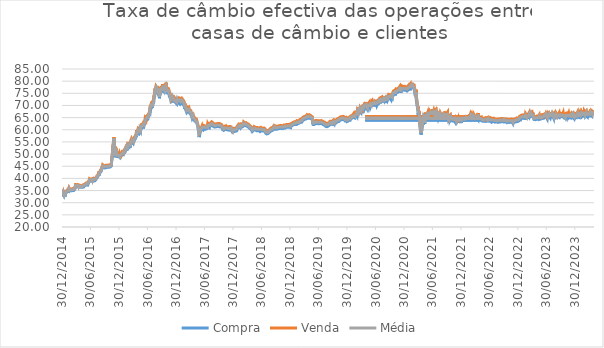
| Category | Compra | Venda | Média |
|---|---|---|---|
| 30/12/2014 | 32.49 | 33.15 | 32.82 |
| 31/12/2014 | 32.87 | 33.65 | 33.26 |
| 05/01/2015 | 33.7 | 34.37 | 34.04 |
| 06/01/2015 | 33.32 | 34.04 | 33.68 |
| 07/01/2015 | 32.98 | 33.72 | 33.35 |
| 08/01/2015 | 33.37 | 34.12 | 33.75 |
| 09/01/2015 | 33.6 | 34.32 | 33.96 |
| 12/01/2015 | 33.06 | 33.74 | 33.4 |
| 13/01/2015 | 33.2 | 33.86 | 33.53 |
| 14/01/2015 | 33.52 | 34.12 | 33.82 |
| 16/01/2015 | 33.72 | 34.39 | 34.06 |
| 19/01/2015 | 33.55 | 34.36 | 33.96 |
| 20/01/2015 | 33.47 | 34.18 | 33.83 |
| 21/01/2015 | 33.24 | 33.99 | 33.62 |
| 22/01/2015 | 33.83 | 34.48 | 34.16 |
| 23/01/2015 | 33.92 | 34.58 | 34.25 |
| 26/01/2015 | 33.51 | 34.37 | 33.94 |
| 27/01/2015 | 34.03 | 34.68 | 34.36 |
| 28/01/2015 | 33.82 | 34.59 | 34.21 |
| 29/01/2015 | 34.3 | 35.06 | 34.68 |
| 30/01/2015 | 34.33 | 34.99 | 34.66 |
| 02/02/2015 | 34.4 | 35.17 | 34.79 |
| 04/02/2015 | 34.48 | 35.26 | 34.87 |
| 05/02/2015 | 34.62 | 35.43 | 35.03 |
| 06/02/2015 | 34.03 | 34.74 | 34.39 |
| 09/02/2015 | 34.87 | 35.56 | 35.22 |
| 10/02/2015 | 35.17 | 35.89 | 35.53 |
| 11/02/2015 | 35.05 | 35.87 | 35.46 |
| 12/02/2015 | 35.44 | 36.15 | 35.8 |
| 13/02/2015 | 35.18 | 35.85 | 35.52 |
| 16/02/2015 | 34.82 | 35.58 | 35.2 |
| 17/02/2015 | 34.72 | 35.47 | 35.1 |
| 18/02/2015 | 34.9 | 35.59 | 35.25 |
| 19/02/2015 | 34.98 | 35.76 | 35.37 |
| 20/02/2015 | 35.07 | 35.65 | 35.36 |
| 23/02/2015 | 34.9 | 35.53 | 35.22 |
| 24/02/2015 | 35.01 | 35.58 | 35.3 |
| 25/02/2015 | 34.67 | 35.52 | 35.1 |
| 26/02/2015 | 34.53 | 35.23 | 34.88 |
| 27/02/2015 | 35.12 | 35.68 | 35.4 |
| 02/03/2015 | 34.93 | 35.69 | 35.31 |
| 03/03/2015 | 35.16 | 35.85 | 35.51 |
| 04/03/2015 | 34.98 | 35.68 | 35.33 |
| 05/03/2015 | 34.97 | 35.72 | 35.35 |
| 06/03/2015 | 35.12 | 35.82 | 35.47 |
| 09/03/2015 | 34.98 | 35.8 | 35.39 |
| 10/03/2015 | 35.18 | 35.87 | 35.53 |
| 11/03/2015 | 35.21 | 35.9 | 35.56 |
| 12/03/2015 | 34.99 | 35.7 | 35.35 |
| 13/03/2015 | 35.16 | 35.85 | 35.51 |
| 16/03/2015 | 35.05 | 35.88 | 35.47 |
| 17/03/2015 | 34.9 | 35.67 | 35.29 |
| 18/03/2015 | 34.93 | 35.66 | 35.3 |
| 19/03/2015 | 35.18 | 35.8 | 35.49 |
| 20/03/2015 | 35.33 | 36.04 | 35.69 |
| 23/03/2015 | 35.71 | 36.37 | 36.04 |
| 24/03/2015 | 35.78 | 36.6 | 36.19 |
| 25/03/2015 | 36.32 | 36.99 | 36.66 |
| 26/03/2015 | 36.73 | 37.45 | 37.09 |
| 27/03/2015 | 36.85 | 37.63 | 37.24 |
| 30/03/2015 | 36.85 | 37.6 | 37.23 |
| 31/03/2015 | 36.95 | 37.71 | 37.33 |
| 01/04/2015 | 36.61 | 37.27 | 36.94 |
| 02/04/2015 | 36.64 | 37.43 | 37.04 |
| 03/04/2015 | 36.83 | 37.56 | 37.2 |
| 06/04/2015 | 36.81 | 37.6 | 37.21 |
| 08/04/2015 | 36.59 | 37.45 | 37.02 |
| 09/04/2015 | 36.64 | 37.36 | 37 |
| 10/04/2015 | 36.59 | 37.31 | 36.95 |
| 13/04/2015 | 36.21 | 36.86 | 36.54 |
| 14/04/2015 | 36.45 | 37.22 | 36.84 |
| 15/04/2015 | 36.69 | 37.35 | 37.02 |
| 16/04/2015 | 36.52 | 37.21 | 36.87 |
| 17/04/2015 | 36.46 | 37.21 | 36.84 |
| 20/04/2015 | 36.66 | 37.34 | 37 |
| 21/04/2015 | 36.36 | 37.09 | 36.73 |
| 22/04/2015 | 36.44 | 37.18 | 36.81 |
| 23/04/2015 | 36.22 | 37.05 | 36.64 |
| 24/04/2015 | 36.33 | 37.08 | 36.71 |
| 27/04/2015 | 36.31 | 37.06 | 36.69 |
| 28/04/2015 | 36.16 | 36.98 | 36.57 |
| 29/04/2015 | 36.17 | 36.93 | 36.55 |
| 30/04/2015 | 36.35 | 37.09 | 36.72 |
| 04/05/2015 | 36.39 | 37.14 | 36.77 |
| 05/05/2015 | 36.25 | 36.98 | 36.62 |
| 06/05/2015 | 36.19 | 36.95 | 36.57 |
| 07/05/2015 | 36.21 | 36.99 | 36.6 |
| 08/05/2015 | 36.33 | 37.08 | 36.71 |
| 11/05/2015 | 36.32 | 37.14 | 36.73 |
| 12/05/2015 | 36.31 | 37.17 | 36.74 |
| 13/05/2015 | 36.49 | 37.29 | 36.89 |
| 14/05/2015 | 36.42 | 37.2 | 36.81 |
| 15/05/2015 | 36.61 | 37.29 | 36.95 |
| 18/05/2015 | 36.49 | 37.46 | 36.98 |
| 19/05/2015 | 36.73 | 37.49 | 37.11 |
| 20/05/2015 | 36.79 | 37.54 | 37.17 |
| 21/05/2015 | 36.85 | 37.5 | 37.18 |
| 22/05/2015 | 37.08 | 37.82 | 37.45 |
| 25/05/2015 | 36.88 | 37.66 | 37.27 |
| 26/05/2015 | 37.01 | 37.75 | 37.38 |
| 27/05/2015 | 36.97 | 37.67 | 37.32 |
| 28/05/2015 | 36.95 | 37.69 | 37.32 |
| 29/05/2015 | 37.08 | 37.86 | 37.47 |
| 01/06/2015 | 37.09 | 37.84 | 37.47 |
| 02/06/2015 | 37.38 | 38.12 | 37.75 |
| 03/06/2015 | 37.23 | 37.92 | 37.58 |
| 04/06/2015 | 37.13 | 37.95 | 37.54 |
| 05/06/2015 | 37.29 | 37.98 | 37.64 |
| 08/06/2015 | 37.3 | 38.11 | 37.71 |
| 09/06/2015 | 37.31 | 38.09 | 37.7 |
| 10/06/2015 | 37.41 | 38.2 | 37.81 |
| 11/06/2015 | 37.49 | 38.22 | 37.86 |
| 12/06/2015 | 37.24 | 38.02 | 37.63 |
| 15/06/2015 | 37.78 | 38.56 | 38.17 |
| 16/06/2015 | 37.94 | 38.68 | 38.31 |
| 17/06/2015 | 38.08 | 38.76 | 38.42 |
| 18/06/2015 | 38.09 | 38.82 | 38.46 |
| 19/06/2015 | 38.12 | 38.93 | 38.53 |
| 22/06/2015 | 38.53 | 39.3 | 38.92 |
| 23/06/2015 | 38.53 | 39.32 | 38.93 |
| 24/06/2015 | 38.97 | 39.88 | 39.43 |
| 26/06/2015 | 39.15 | 39.91 | 39.53 |
| 29/06/2015 | 38.9 | 39.79 | 39.35 |
| 30/06/2015 | 39.09 | 39.84 | 39.47 |
| 01/07/2015 | 38.95 | 39.62 | 39.29 |
| 02/07/2015 | 38.97 | 39.8 | 39.39 |
| 03/07/2015 | 39.11 | 39.98 | 39.55 |
| 06/07/2015 | 39.01 | 39.85 | 39.43 |
| 07/07/2015 | 39.01 | 39.72 | 39.37 |
| 08/07/2015 | 38.85 | 39.77 | 39.31 |
| 09/07/2015 | 39.01 | 39.85 | 39.43 |
| 10/07/2015 | 39.21 | 40 | 39.61 |
| 13/07/2015 | 39.11 | 39.89 | 39.5 |
| 14/07/2015 | 39.08 | 39.89 | 39.49 |
| 15/07/2015 | 39.15 | 39.98 | 39.57 |
| 16/07/2015 | 38.75 | 39.52 | 39.14 |
| 17/07/2015 | 39.1 | 39.88 | 39.49 |
| 20/07/2015 | 39.25 | 39.99 | 39.62 |
| 21/07/2015 | 39.25 | 40.03 | 39.64 |
| 22/07/2015 | 38.89 | 39.69 | 39.29 |
| 23/07/2015 | 38.84 | 39.68 | 39.26 |
| 24/07/2015 | 39.25 | 40.01 | 39.63 |
| 27/07/2015 | 39.1 | 39.97 | 39.54 |
| 28/07/2015 | 39.18 | 39.97 | 39.58 |
| 29/07/2015 | 39.07 | 39.86 | 39.47 |
| 30/07/2015 | 39.17 | 40.02 | 39.6 |
| 31/07/2015 | 39.34 | 40.09 | 39.72 |
| 03/08/2015 | 39.44 | 40.14 | 39.79 |
| 04/08/2015 | 39.51 | 40.33 | 39.92 |
| 05/08/2015 | 39.8 | 40.51 | 40.16 |
| 06/08/2015 | 39.71 | 40.58 | 40.15 |
| 07/08/2015 | 39.95 | 40.8 | 40.38 |
| 10/08/2015 | 40.17 | 40.95 | 40.56 |
| 11/08/2015 | 40.24 | 41.06 | 40.65 |
| 12/08/2015 | 40.26 | 41.04 | 40.65 |
| 13/08/2015 | 40.33 | 41.2 | 40.77 |
| 14/08/2015 | 40.43 | 41.24 | 40.84 |
| 17/08/2015 | 40.56 | 41.43 | 41 |
| 18/08/2015 | 40.55 | 41.44 | 41 |
| 19/08/2015 | 40.83 | 41.69 | 41.26 |
| 20/08/2015 | 41.42 | 42.37 | 41.9 |
| 21/08/2015 | 41.38 | 42.09 | 41.74 |
| 24/08/2015 | 41.4 | 42.29 | 41.85 |
| 25/08/2015 | 41.46 | 42.31 | 41.89 |
| 26/08/2015 | 41.46 | 42.17 | 41.82 |
| 27/08/2015 | 41.58 | 42.49 | 42.04 |
| 28/08/2015 | 42.03 | 42.9 | 42.47 |
| 31/08/2015 | 41.8 | 42.96 | 42.38 |
| 01/09/2015 | 42.46 | 43.29 | 42.88 |
| 02/09/2015 | 42.54 | 43.45 | 43 |
| 03/09/2015 | 42.61 | 43.35 | 42.98 |
| 04/09/2015 | 42.67 | 43.23 | 42.95 |
| 08/09/2015 | 43.08 | 43.86 | 43.47 |
| 09/09/2015 | 42.97 | 43.84 | 43.41 |
| 10/09/2015 | 43.33 | 44.06 | 43.7 |
| 11/09/2015 | 43.99 | 44.67 | 44.33 |
| 14/09/2015 | 44.21 | 45.17 | 44.69 |
| 15/09/2015 | 44.22 | 45.25 | 44.74 |
| 16/09/2015 | 44.69 | 45.62 | 45.16 |
| 17/09/2015 | 44.55 | 45.21 | 44.88 |
| 18/09/2015 | 44.55 | 45.42 | 44.99 |
| 21/09/2015 | 44.51 | 45.52 | 45.02 |
| 22/09/2015 | 44.35 | 45.37 | 44.86 |
| 23/09/2015 | 44.37 | 45.21 | 44.79 |
| 24/09/2015 | 44.53 | 45.41 | 44.97 |
| 28/09/2015 | 44.35 | 45.25 | 44.8 |
| 29/09/2015 | 44.41 | 45.17 | 44.79 |
| 30/09/2015 | 44.26 | 45.16 | 44.71 |
| 01/10/2015 | 44.44 | 45.4 | 44.92 |
| 02/10/2015 | 44.57 | 45.56 | 45.07 |
| 06/10/2015 | 44.32 | 45.21 | 44.77 |
| 07/10/2015 | 44.49 | 45.44 | 44.97 |
| 08/10/2015 | 44.41 | 45.44 | 44.93 |
| 09/10/2015 | 44.28 | 45.24 | 44.76 |
| 12/10/2015 | 44.25 | 45.21 | 44.73 |
| 13/10/2015 | 44.35 | 45.31 | 44.83 |
| 14/10/2015 | 44.5 | 45.37 | 44.94 |
| 15/10/2015 | 44.7 | 45.62 | 45.16 |
| 16/10/2015 | 44.49 | 45.36 | 44.93 |
| 19/10/2015 | 44.42 | 45.3 | 44.86 |
| 20/10/2015 | 44.59 | 45.46 | 45.03 |
| 21/10/2015 | 44.58 | 45.47 | 45.03 |
| 22/10/2015 | 44.57 | 45.42 | 45 |
| 23/10/2015 | 44.54 | 45.4 | 44.97 |
| 26/10/2015 | 44.63 | 45.56 | 45.1 |
| 27/10/2015 | 44.6 | 45.59 | 45.1 |
| 28/10/2015 | 44.58 | 45.41 | 45 |
| 29/10/2015 | 44.71 | 45.63 | 45.17 |
| 30/10/2015 | 44.64 | 45.59 | 45.12 |
| 02/11/2015 | 44.81 | 45.7 | 45.26 |
| 03/11/2015 | 44.7 | 45.57 | 45.14 |
| 04/11/2015 | 44.73 | 45.73 | 45.23 |
| 05/11/2015 | 44.78 | 45.67 | 45.23 |
| 06/11/2015 | 44.79 | 45.72 | 45.26 |
| 09/11/2015 | 44.89 | 45.72 | 45.31 |
| 11/11/2015 | 45.1 | 45.98 | 45.54 |
| 12/11/2015 | 45.91 | 46.84 | 46.38 |
| 13/11/2015 | 47.31 | 48.17 | 47.74 |
| 16/11/2015 | 48.52 | 49.43 | 48.98 |
| 17/11/2015 | 49.18 | 49.62 | 49.4 |
| 18/11/2015 | 50.23 | 50.95 | 50.59 |
| 19/11/2015 | 50.13 | 50.93 | 50.53 |
| 20/11/2015 | 52.17 | 53.19 | 52.68 |
| 23/11/2015 | 51.61 | 53.09 | 52.35 |
| 24/11/2015 | 54.06 | 54.81 | 54.44 |
| 25/11/2015 | 54.84 | 56.17 | 55.51 |
| 26/11/2015 | 55.63 | 56.56 | 56.1 |
| 27/11/2015 | 56.11 | 56.99 | 56.55 |
| 30/11/2015 | 53.83 | 55.09 | 54.46 |
| 01/12/2015 | 51.81 | 53 | 52.41 |
| 02/12/2015 | 48.72 | 49.95 | 49.34 |
| 03/12/2015 | 50.32 | 51.6 | 50.96 |
| 04/12/2015 | 51.95 | 53.03 | 52.49 |
| 07/12/2015 | 51.14 | 52.24 | 51.69 |
| 08/12/2015 | 51.72 | 52.97 | 52.35 |
| 09/12/2015 | 50.79 | 51.8 | 51.3 |
| 10/12/2015 | 51.15 | 52.25 | 51.7 |
| 11/12/2015 | 51.08 | 52.39 | 51.74 |
| 14/12/2015 | 50.25 | 51.17 | 50.71 |
| 15/12/2015 | 49.77 | 50.77 | 50.27 |
| 16/12/2015 | 49.82 | 50.88 | 50.35 |
| 17/12/2015 | 49.45 | 50.38 | 49.92 |
| 18/12/2015 | 48.99 | 49.93 | 49.46 |
| 21/12/2015 | 49.04 | 50.04 | 49.54 |
| 22/12/2015 | 49.05 | 50.14 | 49.6 |
| 23/12/2015 | 48.97 | 49.97 | 49.47 |
| 24/12/2015 | 48.94 | 50.21 | 49.58 |
| 28/12/2015 | 49.01 | 49.96 | 49.49 |
| 29/12/2015 | 49.09 | 50.04 | 49.57 |
| 30/12/2015 | 48.98 | 50.16 | 49.57 |
| 31/12/2015 | 48.97 | 50.47 | 49.72 |
| 04/01/2016 | 48.65 | 49.4 | 49.03 |
| 05/01/2016 | 49.3 | 50.37 | 49.84 |
| 06/01/2016 | 48.87 | 49.9 | 49.39 |
| 07/01/2016 | 49 | 50.1 | 49.55 |
| 08/01/2016 | 48.77 | 49.9 | 49.34 |
| 11/01/2016 | 48.96 | 50.11 | 49.54 |
| 12/01/2016 | 48.94 | 50.12 | 49.53 |
| 13/01/2016 | 49.24 | 50.5 | 49.87 |
| 14/01/2016 | 49.22 | 50.12 | 49.67 |
| 15/01/2016 | 49.05 | 50.02 | 49.54 |
| 18/01/2016 | 49.37 | 50.29 | 49.83 |
| 19/01/2016 | 49.84 | 50.86 | 50.35 |
| 20/01/2016 | 49.63 | 50.82 | 50.23 |
| 21/01/2016 | 49.44 | 50.51 | 49.98 |
| 22/01/2016 | 49.9 | 50.82 | 50.36 |
| 25/01/2016 | 49.78 | 50.86 | 50.32 |
| 26/01/2016 | 49.75 | 50.64 | 50.2 |
| 27/01/2016 | 50.18 | 51.27 | 50.73 |
| 28/01/2016 | 50.29 | 51.48 | 50.89 |
| 29/01/2016 | 50.6 | 51.55 | 51.08 |
| 01/02/2016 | 50.57 | 51.36 | 50.97 |
| 02/02/2016 | 50.5 | 51.41 | 50.96 |
| 04/02/2016 | 50.88 | 51.93 | 51.41 |
| 05/02/2016 | 50.72 | 51.57 | 51.15 |
| 08/02/2016 | 51.2 | 52.25 | 51.73 |
| 09/02/2016 | 51.82 | 52.6 | 52.21 |
| 10/02/2016 | 51.38 | 52.43 | 51.91 |
| 11/02/2016 | 51.17 | 52.16 | 51.67 |
| 12/02/2016 | 51.57 | 52.53 | 52.05 |
| 15/02/2016 | 51.55 | 52.57 | 52.06 |
| 16/02/2016 | 51.71 | 52.73 | 52.22 |
| 17/02/2016 | 52.16 | 53.12 | 52.64 |
| 18/02/2016 | 51.27 | 52.28 | 51.78 |
| 19/02/2016 | 52.51 | 53.45 | 52.98 |
| 22/02/2016 | 51.68 | 52.84 | 52.26 |
| 23/02/2016 | 53.44 | 54.5 | 53.97 |
| 24/02/2016 | 52.98 | 53.92 | 53.45 |
| 25/02/2016 | 53.47 | 54.42 | 53.95 |
| 26/02/2016 | 53.33 | 54.23 | 53.78 |
| 29/02/2016 | 53.06 | 54.18 | 53.62 |
| 01/03/2016 | 53.42 | 54.66 | 54.04 |
| 02/03/2016 | 53.45 | 54.55 | 54 |
| 03/03/2016 | 53.05 | 54.31 | 53.68 |
| 04/03/2016 | 53.86 | 54.99 | 54.43 |
| 07/03/2016 | 54.13 | 55.2 | 54.67 |
| 08/03/2016 | 53.99 | 55.04 | 54.52 |
| 09/03/2016 | 53.99 | 55.04 | 54.52 |
| 10/03/2016 | 52.66 | 53.79 | 53.23 |
| 11/03/2016 | 53.76 | 54.94 | 54.35 |
| 14/03/2016 | 53.9 | 54.95 | 54.43 |
| 15/03/2016 | 53.72 | 54.9 | 54.31 |
| 16/03/2016 | 54.96 | 55.79 | 55.38 |
| 17/03/2016 | 54.81 | 55.76 | 55.29 |
| 18/03/2016 | 54.08 | 55.11 | 54.6 |
| 21/03/2016 | 54.41 | 55.35 | 54.88 |
| 22/03/2016 | 54.73 | 56.04 | 55.39 |
| 23/03/2016 | 54.12 | 55.38 | 54.75 |
| 24/03/2016 | 55.08 | 56.14 | 55.61 |
| 28/03/2016 | 55.31 | 56.4 | 55.86 |
| 29/03/2016 | 54.61 | 55.78 | 55.2 |
| 30/03/2016 | 54.61 | 55.69 | 55.15 |
| 31/03/2016 | 55.43 | 56.42 | 55.93 |
| 01/04/2016 | 54.72 | 55.78 | 55.25 |
| 04/04/2016 | 54.99 | 56.25 | 55.62 |
| 05/04/2016 | 55.73 | 56.83 | 56.28 |
| 06/04/2016 | 56.01 | 57.07 | 56.54 |
| 08/04/2016 | 55.79 | 56.78 | 56.29 |
| 11/04/2016 | 56.14 | 57.33 | 56.74 |
| 12/04/2016 | 56.16 | 57.43 | 56.8 |
| 13/04/2016 | 56.27 | 57.14 | 56.71 |
| 14/04/2016 | 56.7 | 57.78 | 57.24 |
| 15/04/2016 | 56.59 | 57.63 | 57.11 |
| 18/04/2016 | 57.47 | 58.43 | 57.95 |
| 19/04/2016 | 57.06 | 58.03 | 57.55 |
| 20/04/2016 | 56.9 | 58.08 | 57.49 |
| 21/04/2016 | 58.69 | 59.83 | 59.26 |
| 22/04/2016 | 57.86 | 58.85 | 58.36 |
| 25/04/2016 | 58.28 | 59.4 | 58.84 |
| 26/04/2016 | 58.53 | 59.39 | 58.96 |
| 27/04/2016 | 58.15 | 59.15 | 58.65 |
| 28/04/2016 | 58.6 | 59.62 | 59.11 |
| 29/04/2016 | 58.92 | 60.2 | 59.56 |
| 03/05/2016 | 58.53 | 59.69 | 59.11 |
| 04/05/2016 | 58.52 | 59.72 | 59.12 |
| 05/05/2016 | 58.86 | 59.85 | 59.36 |
| 06/05/2016 | 58.42 | 59.51 | 58.97 |
| 09/05/2016 | 58.52 | 59.68 | 59.1 |
| 10/05/2016 | 58.66 | 59.8 | 59.23 |
| 11/05/2016 | 59.22 | 60.31 | 59.77 |
| 12/05/2016 | 59.78 | 61.11 | 60.45 |
| 13/05/2016 | 59.66 | 60.84 | 60.25 |
| 16/05/2016 | 59.33 | 60.52 | 59.93 |
| 17/05/2016 | 60.15 | 61.3 | 60.73 |
| 18/05/2016 | 59.75 | 60.95 | 60.35 |
| 19/05/2016 | 60.24 | 61.72 | 60.98 |
| 20/05/2016 | 60.38 | 61.52 | 60.95 |
| 23/05/2016 | 61.4 | 62.54 | 61.97 |
| 24/05/2016 | 61.08 | 61.96 | 61.52 |
| 25/05/2016 | 60.82 | 61.9 | 61.36 |
| 26/05/2016 | 60.94 | 62.36 | 61.65 |
| 27/05/2016 | 60.93 | 62.05 | 61.49 |
| 30/05/2016 | 61.08 | 62.04 | 61.56 |
| 31/05/2016 | 61.41 | 62.65 | 62.03 |
| 01/06/2016 | 61.25 | 62.6 | 61.93 |
| 02/06/2016 | 61.41 | 62.64 | 62.03 |
| 03/06/2016 | 60.55 | 61.69 | 61.12 |
| 06/06/2016 | 61.35 | 62.65 | 62 |
| 07/06/2016 | 61.65 | 62.94 | 62.3 |
| 08/06/2016 | 61.82 | 62.89 | 62.36 |
| 09/06/2016 | 62.1 | 63.16 | 62.63 |
| 10/06/2016 | 62.03 | 62.94 | 62.49 |
| 13/06/2016 | 62.47 | 63.95 | 63.21 |
| 14/06/2016 | 62.23 | 63.52 | 62.88 |
| 15/06/2016 | 63.25 | 64.5 | 63.88 |
| 16/06/2016 | 63.7 | 64.71 | 64.21 |
| 17/06/2016 | 63.23 | 64.45 | 63.84 |
| 20/06/2016 | 63 | 63.96 | 63.48 |
| 21/06/2016 | 63.5 | 64.69 | 64.1 |
| 22/06/2016 | 64.1 | 65.47 | 64.79 |
| 23/06/2016 | 64.03 | 65.22 | 64.63 |
| 24/06/2016 | 64.4 | 65.58 | 64.99 |
| 27/06/2016 | 64.04 | 65.27 | 64.66 |
| 28/06/2016 | 64.12 | 65.34 | 64.73 |
| 29/06/2016 | 64.65 | 65.83 | 65.24 |
| 30/06/2016 | 63.91 | 65.17 | 64.54 |
| 01/07/2016 | 64.63 | 65.85 | 65.24 |
| 04/07/2016 | 64.69 | 65.85 | 65.27 |
| 05/07/2016 | 65.14 | 66.29 | 65.72 |
| 06/07/2016 | 64.91 | 66.16 | 65.54 |
| 07/07/2016 | 65.18 | 66.49 | 65.84 |
| 08/07/2016 | 65.38 | 66.63 | 66.01 |
| 11/07/2016 | 65.91 | 67.14 | 66.53 |
| 12/07/2016 | 66.37 | 67.49 | 66.93 |
| 13/07/2016 | 67.02 | 67.74 | 67.38 |
| 14/07/2016 | 67.39 | 68.26 | 67.83 |
| 15/07/2016 | 68.15 | 69.37 | 68.76 |
| 18/07/2016 | 67.69 | 69.02 | 68.36 |
| 19/07/2016 | 68.03 | 69.19 | 68.61 |
| 20/07/2016 | 68.56 | 69.71 | 69.14 |
| 21/07/2016 | 68.95 | 70.23 | 69.59 |
| 22/07/2016 | 68.91 | 70.17 | 69.54 |
| 25/07/2016 | 69.02 | 70.42 | 69.72 |
| 26/07/2016 | 68.83 | 70.14 | 69.49 |
| 27/07/2016 | 69.97 | 71.35 | 70.66 |
| 28/07/2016 | 69.02 | 70.26 | 69.64 |
| 29/07/2016 | 70.18 | 71.56 | 70.87 |
| 01/08/2016 | 69.4 | 70.71 | 70.06 |
| 02/08/2016 | 70.35 | 71.64 | 71 |
| 03/08/2016 | 70.38 | 71.77 | 71.08 |
| 04/08/2016 | 70.46 | 71.86 | 71.16 |
| 05/08/2016 | 70.82 | 71.88 | 71.35 |
| 08/08/2016 | 71.24 | 71.84 | 71.54 |
| 09/08/2016 | 71.44 | 72.87 | 72.16 |
| 10/08/2016 | 72.76 | 74.05 | 73.41 |
| 11/08/2016 | 73.18 | 73.56 | 73.37 |
| 12/08/2016 | 72.99 | 74.37 | 73.68 |
| 15/08/2016 | 73.84 | 75.42 | 74.63 |
| 16/08/2016 | 74.62 | 75.84 | 75.23 |
| 17/08/2016 | 75.86 | 76.97 | 76.42 |
| 18/08/2016 | 75.16 | 76.15 | 75.66 |
| 19/08/2016 | 75.54 | 76.82 | 76.18 |
| 22/08/2016 | 76.29 | 77.73 | 77.01 |
| 23/08/2016 | 76.61 | 78.08 | 77.35 |
| 24/08/2016 | 76.14 | 77.47 | 76.81 |
| 25/08/2016 | 75.9 | 77.55 | 76.73 |
| 26/08/2016 | 75.84 | 77.2 | 76.52 |
| 29/08/2016 | 76.46 | 78 | 77.23 |
| 30/08/2016 | 75.47 | 77.48 | 76.48 |
| 31/08/2016 | 76.19 | 77.72 | 76.96 |
| 01/09/2016 | 76.06 | 77.46 | 76.76 |
| 02/09/2016 | 75.91 | 77.23 | 76.57 |
| 05/09/2016 | 75.48 | 77.06 | 76.27 |
| 06/09/2016 | 76.1 | 77.69 | 76.9 |
| 08/09/2016 | 74.48 | 75.8 | 75.14 |
| 09/09/2016 | 74.12 | 75.45 | 74.79 |
| 12/09/2016 | 74 | 75.4 | 74.7 |
| 13/09/2016 | 74.07 | 75.81 | 74.94 |
| 14/09/2016 | 72.96 | 74.15 | 73.56 |
| 15/09/2016 | 73.4 | 74.98 | 74.19 |
| 16/09/2016 | 74.09 | 75.27 | 74.68 |
| 19/09/2016 | 74.15 | 75.78 | 74.97 |
| 20/09/2016 | 74.53 | 75.87 | 75.2 |
| 21/09/2016 | 74.52 | 75.69 | 75.11 |
| 22/09/2016 | 75.42 | 76.89 | 76.16 |
| 23/09/2016 | 75.44 | 76.78 | 76.11 |
| 27/09/2016 | 76.61 | 78.03 | 77.32 |
| 28/09/2016 | 75.44 | 77.05 | 76.25 |
| 29/09/2016 | 76.42 | 77.64 | 77.03 |
| 30/09/2016 | 75.93 | 77.39 | 76.66 |
| 03/10/2016 | 75.42 | 76.85 | 76.14 |
| 05/10/2016 | 77.34 | 78.83 | 78.09 |
| 06/10/2016 | 76.75 | 78.25 | 77.5 |
| 07/10/2016 | 76.5 | 77.85 | 77.18 |
| 10/10/2016 | 76.55 | 78.09 | 77.32 |
| 11/10/2016 | 76.15 | 77.59 | 76.87 |
| 12/10/2016 | 76.79 | 78.4 | 77.6 |
| 13/10/2016 | 76.56 | 77.97 | 77.27 |
| 14/10/2016 | 76.43 | 77.87 | 77.15 |
| 17/10/2016 | 76.01 | 77.72 | 76.87 |
| 18/10/2016 | 77.03 | 78.71 | 77.87 |
| 19/10/2016 | 76.08 | 77.28 | 76.68 |
| 20/10/2016 | 76.16 | 77.91 | 77.04 |
| 21/10/2016 | 76.88 | 78.37 | 77.63 |
| 24/10/2016 | 76.88 | 78.4 | 77.64 |
| 25/10/2016 | 77.59 | 78.91 | 78.25 |
| 26/10/2016 | 77.53 | 78.88 | 78.21 |
| 27/10/2016 | 77.5 | 79.41 | 78.46 |
| 28/10/2016 | 76.67 | 78.17 | 77.42 |
| 31/10/2016 | 76.11 | 77.96 | 77.04 |
| 01/11/2016 | 75.97 | 77.28 | 76.63 |
| 02/11/2016 | 74.64 | 76.26 | 75.45 |
| 03/11/2016 | 75.16 | 76.62 | 75.89 |
| 04/11/2016 | 75.3 | 76.69 | 76 |
| 07/11/2016 | 75.37 | 76.88 | 76.13 |
| 08/11/2016 | 75.17 | 76.79 | 75.98 |
| 09/11/2016 | 75.4 | 76.81 | 76.11 |
| 11/11/2016 | 75.32 | 76.86 | 76.09 |
| 14/11/2016 | 74.89 | 76.41 | 75.65 |
| 15/11/2016 | 74.58 | 76.29 | 75.44 |
| 16/11/2016 | 74.16 | 75.76 | 74.96 |
| 17/11/2016 | 73.66 | 75.37 | 74.52 |
| 18/11/2016 | 73.91 | 75.37 | 74.64 |
| 21/11/2016 | 73.43 | 74.87 | 74.15 |
| 22/11/2016 | 73.34 | 74.47 | 73.91 |
| 23/11/2016 | 72.92 | 74.27 | 73.6 |
| 24/11/2016 | 73.37 | 74.76 | 74.07 |
| 25/11/2016 | 72.36 | 73.67 | 73.02 |
| 28/11/2016 | 72.79 | 74.33 | 73.56 |
| 29/11/2016 | 71.55 | 73.06 | 72.31 |
| 30/11/2016 | 71.82 | 73.59 | 72.71 |
| 01/12/2016 | 71.67 | 73.14 | 72.41 |
| 02/12/2016 | 71.31 | 72.59 | 71.95 |
| 05/12/2016 | 71.31 | 72.73 | 72.02 |
| 06/12/2016 | 71.76 | 73.07 | 72.42 |
| 07/12/2016 | 71.68 | 73.1 | 72.39 |
| 08/12/2016 | 72.2 | 73.51 | 72.86 |
| 09/12/2016 | 72.79 | 74.2 | 73.5 |
| 12/12/2016 | 72.4 | 73.77 | 73.09 |
| 13/12/2016 | 72.49 | 73.72 | 73.11 |
| 14/12/2016 | 72.75 | 73 | 72.88 |
| 15/12/2016 | 72.36 | 73.65 | 73.01 |
| 16/12/2016 | 72.11 | 73.3 | 72.71 |
| 19/12/2016 | 71.17 | 72.76 | 71.97 |
| 20/12/2016 | 71.06 | 72.35 | 71.71 |
| 21/12/2016 | 71.6 | 73.12 | 72.36 |
| 22/12/2016 | 71.22 | 72.6 | 71.91 |
| 23/12/2016 | 71.23 | 72.67 | 71.95 |
| 27/12/2016 | 71.12 | 72.52 | 71.82 |
| 28/12/2016 | 70.87 | 72.37 | 71.62 |
| 29/12/2016 | 71.25 | 72.49 | 71.87 |
| 30/12/2016 | 71.31 | 72.67 | 71.99 |
| 03/01/2017 | 70.64 | 72.01 | 71.33 |
| 04/01/2017 | 71.11 | 72.85 | 71.98 |
| 05/01/2017 | 70.97 | 72.26 | 71.62 |
| 06/01/2017 | 71.8 | 73.29 | 72.55 |
| 09/01/2017 | 71.32 | 73.01 | 72.17 |
| 10/01/2017 | 71.2 | 72.63 | 71.92 |
| 11/01/2017 | 71.54 | 72.83 | 72.19 |
| 12/01/2017 | 71.4 | 72.73 | 72.07 |
| 13/01/2017 | 71.53 | 73.02 | 72.28 |
| 16/01/2017 | 70.94 | 72.48 | 71.71 |
| 17/01/2017 | 71.49 | 73.13 | 72.31 |
| 18/01/2017 | 71.77 | 73.08 | 72.43 |
| 19/01/2017 | 71.53 | 72.9 | 72.22 |
| 20/01/2017 | 71.47 | 72.9 | 72.19 |
| 23/01/2017 | 71.68 | 73.17 | 72.43 |
| 24/01/2017 | 71.48 | 72.76 | 72.12 |
| 25/01/2017 | 71.54 | 72.89 | 72.22 |
| 26/01/2017 | 71.28 | 72.81 | 72.05 |
| 27/01/2017 | 71.04 | 72.58 | 71.81 |
| 30/01/2017 | 71.46 | 72.86 | 72.16 |
| 31/01/2017 | 71.57 | 72.98 | 72.28 |
| 01/02/2017 | 70.86 | 72.47 | 71.67 |
| 02/02/2017 | 70.98 | 72.39 | 71.69 |
| 06/02/2017 | 71.11 | 72.62 | 71.87 |
| 07/02/2017 | 71.09 | 72.41 | 71.75 |
| 08/02/2017 | 71.28 | 72.68 | 71.98 |
| 09/02/2017 | 71.3 | 72.66 | 71.98 |
| 10/02/2017 | 71.2 | 72.52 | 71.86 |
| 13/02/2017 | 71.38 | 72.34 | 71.86 |
| 14/02/2017 | 71.5 | 72.9 | 72.2 |
| 15/02/2017 | 70.46 | 72.06 | 71.26 |
| 16/02/2017 | 70.59 | 72.09 | 71.34 |
| 17/02/2017 | 70.96 | 72.28 | 71.62 |
| 20/02/2017 | 69.8 | 71.76 | 70.78 |
| 21/02/2017 | 70.19 | 71.24 | 70.72 |
| 22/02/2017 | 69.74 | 71.03 | 70.39 |
| 23/02/2017 | 68.69 | 70.3 | 69.5 |
| 24/02/2017 | 69.3 | 70.79 | 70.05 |
| 27/02/2017 | 68.62 | 70.14 | 69.38 |
| 28/02/2017 | 68.58 | 70.12 | 69.35 |
| 01/03/2017 | 68.98 | 70.49 | 69.74 |
| 02/03/2017 | 68.12 | 69.8 | 68.96 |
| 03/03/2017 | 67.98 | 69.35 | 68.67 |
| 06/03/2017 | 67.92 | 69.44 | 68.68 |
| 07/03/2017 | 67.87 | 69.16 | 68.52 |
| 08/03/2017 | 67.13 | 68.59 | 67.86 |
| 09/03/2017 | 67.32 | 68.71 | 68.02 |
| 10/03/2017 | 67.4 | 68.64 | 68.02 |
| 13/03/2017 | 67.42 | 69.06 | 68.24 |
| 14/03/2017 | 67.64 | 68.81 | 68.23 |
| 15/03/2017 | 67.66 | 68.83 | 68.25 |
| 16/03/2017 | 67.81 | 69.15 | 68.48 |
| 17/03/2017 | 67.45 | 68.63 | 68.04 |
| 20/03/2017 | 67.88 | 69.01 | 68.45 |
| 21/03/2017 | 67.84 | 68.83 | 68.34 |
| 22/03/2017 | 67.81 | 69.1 | 68.46 |
| 23/03/2017 | 67.66 | 69.05 | 68.36 |
| 24/03/2017 | 67.49 | 68.86 | 68.18 |
| 27/03/2017 | 66.77 | 68.15 | 67.46 |
| 28/03/2017 | 66.88 | 68.26 | 67.57 |
| 29/03/2017 | 66.68 | 68.15 | 67.42 |
| 30/03/2017 | 66.54 | 67.84 | 67.19 |
| 31/03/2017 | 66.81 | 68.13 | 67.47 |
| 03/04/2017 | 66.49 | 67.9 | 67.2 |
| 04/04/2017 | 66.44 | 67.71 | 67.08 |
| 05/04/2017 | 65.94 | 67.39 | 66.67 |
| 06/04/2017 | 65.94 | 67.39 | 66.67 |
| 10/04/2017 | 65.19 | 66.5 | 65.85 |
| 11/04/2017 | 65.3 | 66.55 | 65.93 |
| 12/04/2017 | 64.68 | 66.11 | 65.4 |
| 13/04/2017 | 65.07 | 66.31 | 65.69 |
| 17/04/2017 | 65.29 | 66.54 | 65.92 |
| 18/04/2017 | 65.13 | 66.35 | 65.74 |
| 19/04/2017 | 64.73 | 65.86 | 65.3 |
| 20/04/2017 | 64.71 | 65.8 | 65.26 |
| 21/04/2017 | 64.23 | 65.81 | 65.02 |
| 24/04/2017 | 63.99 | 65.25 | 64.62 |
| 25/04/2017 | 64.2 | 65.46 | 64.83 |
| 26/04/2017 | 64.29 | 65.54 | 64.92 |
| 27/04/2017 | 64.03 | 65.37 | 64.7 |
| 28/04/2017 | 63.83 | 65.02 | 64.43 |
| 02/05/2017 | 63.18 | 64.62 | 63.9 |
| 03/05/2017 | 63.78 | 64.87 | 64.33 |
| 04/05/2017 | 63.32 | 64.52 | 63.92 |
| 05/05/2017 | 63.33 | 64.45 | 63.89 |
| 08/05/2017 | 62.98 | 64.4 | 63.69 |
| 09/05/2017 | 63.36 | 64.41 | 63.89 |
| 10/05/2017 | 62.98 | 64.1 | 63.54 |
| 11/05/2017 | 62.87 | 64.18 | 63.53 |
| 12/05/2017 | 62.55 | 63.77 | 63.16 |
| 15/05/2017 | 62.14 | 63.43 | 62.79 |
| 16/05/2017 | 61.92 | 62.71 | 62.32 |
| 17/05/2017 | 61.62 | 62.97 | 62.3 |
| 18/05/2017 | 61.12 | 62.5 | 61.81 |
| 19/05/2017 | 60.65 | 61.94 | 61.3 |
| 22/05/2017 | 59.68 | 61.26 | 60.47 |
| 23/05/2017 | 59.59 | 60.66 | 60.13 |
| 24/05/2017 | 58.86 | 60.11 | 59.49 |
| 25/05/2017 | 58.59 | 59.53 | 59.06 |
| 26/05/2017 | 56.99 | 59.74 | 58.37 |
| 29/05/2017 | 57.64 | 58.96 | 58.3 |
| 30/05/2017 | 57.73 | 58.73 | 58.23 |
| 31/05/2017 | 58.15 | 59.38 | 58.77 |
| 01/06/2017 | 58.24 | 59.4 | 58.82 |
| 02/06/2017 | 58.88 | 60 | 59.44 |
| 05/06/2017 | 59.07 | 60.14 | 59.61 |
| 06/06/2017 | 59.67 | 60.79 | 60.23 |
| 07/06/2017 | 59.8 | 61.06 | 60.43 |
| 08/06/2017 | 59.97 | 61.15 | 60.56 |
| 09/06/2017 | 59.96 | 61.1 | 60.53 |
| 12/06/2017 | 60.04 | 61.14 | 60.59 |
| 13/06/2017 | 60.06 | 61.37 | 60.72 |
| 14/06/2017 | 60.53 | 61.76 | 61.15 |
| 15/06/2017 | 60.04 | 61.47 | 60.76 |
| 16/06/2017 | 60.54 | 61.9 | 61.22 |
| 19/06/2017 | 60.42 | 61.47 | 60.95 |
| 20/06/2017 | 60.41 | 61.54 | 60.98 |
| 21/06/2017 | 60.55 | 61.69 | 61.12 |
| 22/06/2017 | 60.28 | 61.42 | 60.85 |
| 23/06/2017 | 60 | 61.56 | 60.78 |
| 27/06/2017 | 60.45 | 61.71 | 61.08 |
| 28/06/2017 | 60.44 | 61.56 | 61 |
| 29/06/2017 | 60.34 | 61.46 | 60.9 |
| 30/06/2017 | 60.23 | 61.47 | 60.85 |
| 03/07/2017 | 60.4 | 61.52 | 60.96 |
| 04/07/2017 | 60.21 | 61.45 | 60.83 |
| 05/07/2017 | 60.37 | 61.61 | 60.99 |
| 06/07/2017 | 60.2 | 61.43 | 60.82 |
| 07/07/2017 | 60.31 | 61.57 | 60.94 |
| 10/07/2017 | 60.43 | 61.54 | 60.99 |
| 11/07/2017 | 60.39 | 61.57 | 60.98 |
| 12/07/2017 | 60.48 | 61.66 | 61.07 |
| 13/07/2017 | 60.44 | 61.57 | 61.01 |
| 14/07/2017 | 60.38 | 61.59 | 60.99 |
| 17/07/2017 | 60.78 | 61.87 | 61.33 |
| 18/07/2017 | 60.51 | 61.83 | 61.17 |
| 19/07/2017 | 60.44 | 61.41 | 60.93 |
| 20/07/2017 | 60.65 | 61.73 | 61.19 |
| 21/07/2017 | 60.89 | 62.56 | 61.73 |
| 24/07/2017 | 60.99 | 62.19 | 61.59 |
| 25/07/2017 | 60.98 | 62.11 | 61.55 |
| 26/07/2017 | 61.19 | 62.28 | 61.74 |
| 27/07/2017 | 61.13 | 62 | 61.57 |
| 28/07/2017 | 61.25 | 62.43 | 61.84 |
| 31/07/2017 | 60.77 | 61.88 | 61.33 |
| 01/08/2017 | 61.31 | 62.63 | 61.97 |
| 02/08/2017 | 61.6 | 62.88 | 62.24 |
| 03/08/2017 | 61.1 | 62.22 | 61.66 |
| 04/08/2017 | 61.52 | 62.84 | 62.18 |
| 07/08/2017 | 61.39 | 62.69 | 62.04 |
| 08/08/2017 | 61.57 | 62.86 | 62.22 |
| 09/08/2017 | 61.74 | 62.81 | 62.28 |
| 10/08/2017 | 61.53 | 62.68 | 62.11 |
| 11/08/2017 | 61.83 | 62.87 | 62.35 |
| 14/08/2017 | 61.85 | 63.13 | 62.49 |
| 15/08/2017 | 61.88 | 63.28 | 62.58 |
| 16/08/2017 | 61.92 | 62.95 | 62.44 |
| 17/08/2017 | 61.69 | 62.95 | 62.32 |
| 18/08/2017 | 61.94 | 63.08 | 62.51 |
| 21/08/2017 | 61.75 | 62.89 | 62.32 |
| 22/08/2017 | 61.66 | 62.89 | 62.28 |
| 23/08/2017 | 61.56 | 62.65 | 62.11 |
| 24/08/2017 | 61.64 | 62.78 | 62.21 |
| 25/08/2017 | 61.4 | 62.75 | 62.08 |
| 28/08/2017 | 61.38 | 62.71 | 62.05 |
| 29/08/2017 | 61.22 | 62.46 | 61.84 |
| 30/08/2017 | 61.18 | 62.47 | 61.83 |
| 31/08/2017 | 61.19 | 62.42 | 61.81 |
| 01/09/2017 | 61.36 | 62.75 | 62.06 |
| 04/09/2017 | 61.25 | 62.59 | 61.92 |
| 05/09/2017 | 61.13 | 62.23 | 61.68 |
| 06/09/2017 | 61.33 | 62.46 | 61.9 |
| 08/09/2017 | 61.33 | 62.57 | 61.95 |
| 11/09/2017 | 61.32 | 62.52 | 61.92 |
| 12/09/2017 | 61.25 | 62.47 | 61.86 |
| 13/09/2017 | 61.23 | 62.53 | 61.88 |
| 14/09/2017 | 61.33 | 62.58 | 61.96 |
| 15/09/2017 | 61.21 | 62.45 | 61.83 |
| 18/09/2017 | 61.26 | 62.51 | 61.89 |
| 19/09/2017 | 61.29 | 62.52 | 61.91 |
| 20/09/2017 | 61.35 | 62.52 | 61.94 |
| 21/09/2017 | 61.11 | 62.58 | 61.85 |
| 22/09/2017 | 61.18 | 62.43 | 61.81 |
| 26/09/2017 | 61.33 | 62.6 | 61.97 |
| 27/09/2017 | 61.26 | 62.52 | 61.89 |
| 28/09/2017 | 61.29 | 62.43 | 61.86 |
| 29/09/2017 | 61.43 | 62.72 | 62.08 |
| 02/10/2017 | 61.28 | 62.45 | 61.87 |
| 03/10/2017 | 61.22 | 62.63 | 61.93 |
| 05/10/2017 | 61.12 | 62.4 | 61.76 |
| 06/10/2017 | 61.35 | 62.46 | 61.91 |
| 09/10/2017 | 61.11 | 62.35 | 61.73 |
| 10/10/2017 | 61.13 | 62.34 | 61.74 |
| 11/10/2017 | 61.15 | 62.32 | 61.74 |
| 12/10/2017 | 60.97 | 62.15 | 61.56 |
| 13/10/2017 | 61 | 62.2 | 61.6 |
| 16/10/2017 | 61.12 | 62.35 | 61.74 |
| 17/10/2017 | 61.02 | 62.18 | 61.6 |
| 18/10/2017 | 60.88 | 62.15 | 61.52 |
| 19/10/2017 | 60.97 | 62.18 | 61.58 |
| 20/10/2017 | 60.92 | 62.06 | 61.49 |
| 23/10/2017 | 60.57 | 61.95 | 61.26 |
| 24/10/2017 | 60.07 | 61.45 | 60.76 |
| 25/10/2017 | 59.99 | 61.43 | 60.71 |
| 26/10/2017 | 59.9 | 61.14 | 60.52 |
| 27/10/2017 | 59.86 | 61.19 | 60.53 |
| 30/10/2017 | 59.87 | 60.99 | 60.43 |
| 31/10/2017 | 59.77 | 60.92 | 60.35 |
| 01/11/2017 | 59.99 | 61.23 | 60.61 |
| 02/11/2017 | 59.77 | 60.61 | 60.19 |
| 03/11/2017 | 59.89 | 61.17 | 60.53 |
| 06/11/2017 | 60.2 | 61.34 | 60.77 |
| 07/11/2017 | 59.98 | 61.12 | 60.55 |
| 08/11/2017 | 59.95 | 61.12 | 60.54 |
| 09/11/2017 | 59.82 | 60.92 | 60.37 |
| 13/11/2017 | 60.08 | 61.33 | 60.71 |
| 14/11/2017 | 60.17 | 61.26 | 60.72 |
| 15/11/2017 | 60.29 | 61.31 | 60.8 |
| 16/11/2017 | 60.2 | 61.5 | 60.85 |
| 17/11/2017 | 60.1 | 61.35 | 60.73 |
| 20/11/2017 | 60.04 | 61.35 | 60.7 |
| 21/11/2017 | 60.1 | 61.2 | 60.65 |
| 22/11/2017 | 59.74 | 61.05 | 60.4 |
| 23/11/2017 | 59.84 | 60.98 | 60.41 |
| 24/11/2017 | 59.95 | 61.07 | 60.51 |
| 27/11/2017 | 59.94 | 61.06 | 60.5 |
| 28/11/2017 | 60.3 | 61.28 | 60.79 |
| 29/11/2017 | 60.03 | 61.27 | 60.65 |
| 30/11/2017 | 60.07 | 61.12 | 60.6 |
| 01/12/2017 | 59.88 | 61.03 | 60.46 |
| 04/12/2017 | 59.82 | 61.07 | 60.45 |
| 05/12/2017 | 60 | 61.2 | 60.6 |
| 06/12/2017 | 60.1 | 61.3 | 60.7 |
| 07/12/2017 | 59.99 | 61.11 | 60.55 |
| 08/12/2017 | 59.99 | 61.16 | 60.58 |
| 11/12/2017 | 59.9 | 61.17 | 60.54 |
| 12/12/2017 | 60.04 | 61.24 | 60.64 |
| 13/12/2017 | 60.17 | 61.36 | 60.77 |
| 14/12/2017 | 60.12 | 61.23 | 60.68 |
| 15/12/2017 | 60.26 | 61.28 | 60.77 |
| 18/12/2017 | 60.14 | 61.43 | 60.79 |
| 19/12/2017 | 59.99 | 61.09 | 60.54 |
| 20/12/2017 | 59.53 | 60.84 | 60.19 |
| 21/12/2017 | 59.58 | 60.85 | 60.22 |
| 22/12/2017 | 59.69 | 60.76 | 60.23 |
| 26/12/2017 | 59 | 60.11 | 59.56 |
| 27/12/2017 | 59.38 | 60.58 | 59.98 |
| 28/12/2017 | 59.4 | 60.51 | 59.96 |
| 29/12/2017 | 59.38 | 60.46 | 59.92 |
| 02/01/2018 | 59.35 | 60.63 | 59.99 |
| 03/01/2018 | 59.42 | 60.61 | 60.02 |
| 04/01/2018 | 59.32 | 60.49 | 59.91 |
| 05/01/2018 | 59.59 | 60.89 | 60.24 |
| 08/01/2018 | 59.86 | 60.65 | 60.26 |
| 09/01/2018 | 59.33 | 60.57 | 59.95 |
| 10/01/2018 | 59.31 | 60.54 | 59.93 |
| 11/01/2018 | 59.42 | 60.54 | 59.98 |
| 12/01/2018 | 59.41 | 60.67 | 60.04 |
| 15/01/2018 | 59.35 | 60.53 | 59.94 |
| 16/01/2018 | 59.38 | 60.56 | 59.97 |
| 17/01/2018 | 59.61 | 60.69 | 60.15 |
| 18/01/2018 | 59.35 | 60.55 | 59.95 |
| 19/01/2018 | 59.61 | 60.97 | 60.29 |
| 22/01/2018 | 59.48 | 60.63 | 60.06 |
| 23/01/2018 | 59.62 | 60.89 | 60.26 |
| 24/01/2018 | 59.9 | 61.08 | 60.49 |
| 25/01/2018 | 59.86 | 61.11 | 60.49 |
| 26/01/2018 | 60.25 | 61.56 | 60.91 |
| 29/01/2018 | 60.51 | 61.69 | 61.1 |
| 30/01/2018 | 60.58 | 61.8 | 61.19 |
| 31/01/2018 | 60.42 | 61.74 | 61.08 |
| 01/02/2018 | 60.94 | 61.93 | 61.44 |
| 02/02/2018 | 60.65 | 61.92 | 61.29 |
| 05/02/2018 | 61.19 | 62.38 | 61.79 |
| 06/02/2018 | 60.92 | 62.12 | 61.52 |
| 07/02/2018 | 61.06 | 62.13 | 61.6 |
| 08/02/2018 | 61.12 | 62.4 | 61.76 |
| 09/02/2018 | 61.08 | 62.32 | 61.7 |
| 12/02/2018 | 61.09 | 62.27 | 61.68 |
| 13/02/2018 | 60.97 | 62.14 | 61.56 |
| 14/02/2018 | 60.77 | 62.11 | 61.44 |
| 15/02/2018 | 60.64 | 61.81 | 61.23 |
| 16/02/2018 | 61.04 | 62.21 | 61.63 |
| 19/02/2018 | 60.98 | 62.19 | 61.59 |
| 20/02/2018 | 61.27 | 62.43 | 61.85 |
| 21/02/2018 | 61.01 | 62.29 | 61.65 |
| 22/02/2018 | 61.26 | 62.41 | 61.84 |
| 23/02/2018 | 61.28 | 62.5 | 61.89 |
| 26/02/2018 | 61.01 | 62.12 | 61.57 |
| 27/02/2018 | 61.18 | 62.29 | 61.74 |
| 28/02/2018 | 61.27 | 62.45 | 61.86 |
| 01/03/2018 | 61.06 | 62.31 | 61.69 |
| 02/03/2018 | 61.26 | 62.41 | 61.84 |
| 05/03/2018 | 61.44 | 62.63 | 62.04 |
| 06/03/2018 | 61.49 | 62.64 | 62.07 |
| 07/03/2018 | 61.67 | 62.71 | 62.19 |
| 08/03/2018 | 62.04 | 63.25 | 62.65 |
| 09/03/2018 | 61.93 | 63.09 | 62.51 |
| 12/03/2018 | 61.98 | 63.22 | 62.6 |
| 13/03/2018 | 61.96 | 63.08 | 62.52 |
| 14/03/2018 | 61.9 | 63.02 | 62.46 |
| 15/03/2018 | 61.83 | 62.87 | 62.35 |
| 16/03/2018 | 61.8 | 63 | 62.4 |
| 19/03/2018 | 61.69 | 62.88 | 62.29 |
| 20/03/2018 | 61.84 | 62.97 | 62.41 |
| 21/03/2018 | 61.8 | 63.03 | 62.42 |
| 22/03/2018 | 61.77 | 62.95 | 62.36 |
| 23/03/2018 | 61.84 | 62.95 | 62.4 |
| 26/03/2018 | 61.77 | 62.91 | 62.34 |
| 27/03/2018 | 61.75 | 62.89 | 62.32 |
| 28/03/2018 | 61.63 | 62.8 | 62.22 |
| 29/03/2018 | 61.42 | 62.59 | 62.01 |
| 02/04/2018 | 61.08 | 62.46 | 61.77 |
| 03/04/2018 | 61.13 | 62.58 | 61.86 |
| 04/04/2018 | 61.33 | 62.54 | 61.94 |
| 05/04/2018 | 61.29 | 62.43 | 61.86 |
| 06/04/2018 | 61.12 | 62.22 | 61.67 |
| 09/04/2018 | 61.06 | 62.29 | 61.68 |
| 10/04/2018 | 60.95 | 62.23 | 61.59 |
| 11/04/2018 | 61.02 | 62.16 | 61.59 |
| 12/04/2018 | 60.79 | 62 | 61.4 |
| 13/04/2018 | 60.7 | 61.95 | 61.33 |
| 16/04/2018 | 60.62 | 61.86 | 61.24 |
| 17/04/2018 | 60.54 | 61.69 | 61.12 |
| 18/04/2018 | 60.56 | 61.76 | 61.16 |
| 19/04/2018 | 60.41 | 61.58 | 61 |
| 20/04/2018 | 60.55 | 61.69 | 61.12 |
| 23/04/2018 | 60.43 | 61.7 | 61.07 |
| 24/04/2018 | 60.48 | 61.47 | 60.98 |
| 25/04/2018 | 60.12 | 61.45 | 60.79 |
| 26/04/2018 | 59.99 | 61.14 | 60.57 |
| 27/04/2018 | 59.74 | 60.9 | 60.32 |
| 30/04/2018 | 59.58 | 60.84 | 60.21 |
| 02/05/2018 | 59.27 | 60.51 | 59.89 |
| 03/05/2018 | 59.59 | 60.7 | 60.15 |
| 04/05/2018 | 59.42 | 60.55 | 59.99 |
| 07/05/2018 | 59.34 | 60.67 | 60.01 |
| 08/05/2018 | 59.58 | 60.63 | 60.11 |
| 09/05/2018 | 59.68 | 60.77 | 60.23 |
| 10/05/2018 | 59.71 | 60.94 | 60.33 |
| 11/05/2018 | 59.75 | 60.98 | 60.37 |
| 14/05/2018 | 60.08 | 61.31 | 60.7 |
| 15/05/2018 | 60.08 | 61.21 | 60.65 |
| 16/05/2018 | 60.16 | 61.31 | 60.74 |
| 17/05/2018 | 60.01 | 61.17 | 60.59 |
| 18/05/2018 | 60.03 | 61.22 | 60.63 |
| 21/05/2018 | 59.94 | 61.03 | 60.49 |
| 22/05/2018 | 59.76 | 60.95 | 60.36 |
| 23/05/2018 | 59.91 | 61.12 | 60.52 |
| 24/05/2018 | 59.98 | 61.08 | 60.53 |
| 25/05/2018 | 59.76 | 61.01 | 60.39 |
| 28/05/2018 | 59.68 | 60.87 | 60.28 |
| 29/05/2018 | 59.92 | 60.93 | 60.43 |
| 30/05/2018 | 59.61 | 60.84 | 60.23 |
| 31/05/2018 | 59.61 | 60.83 | 60.22 |
| 01/06/2018 | 59.53 | 60.66 | 60.1 |
| 04/06/2018 | 59.66 | 60.91 | 60.29 |
| 05/06/2018 | 59.62 | 60.84 | 60.23 |
| 06/06/2018 | 59.56 | 60.88 | 60.22 |
| 07/06/2018 | 59.69 | 60.85 | 60.27 |
| 08/06/2018 | 59.53 | 60.76 | 60.15 |
| 11/06/2018 | 59.55 | 60.76 | 60.16 |
| 12/06/2018 | 59.46 | 60.65 | 60.06 |
| 13/06/2018 | 59.71 | 60.85 | 60.28 |
| 14/06/2018 | 59.47 | 60.61 | 60.04 |
| 15/06/2018 | 59.49 | 60.68 | 60.09 |
| 18/06/2018 | 59.58 | 60.79 | 60.19 |
| 19/06/2018 | 59.58 | 60.75 | 60.17 |
| 20/06/2018 | 59.3 | 60.48 | 59.89 |
| 21/06/2018 | 59.62 | 60.81 | 60.22 |
| 22/06/2018 | 59.5 | 60.55 | 60.03 |
| 26/06/2018 | 59.75 | 61.01 | 60.38 |
| 27/06/2018 | 59.49 | 60.6 | 60.05 |
| 28/06/2018 | 59.8 | 60.94 | 60.37 |
| 29/06/2018 | 59.58 | 60.81 | 60.2 |
| 02/07/2018 | 59.44 | 60.69 | 60.07 |
| 03/07/2018 | 59.51 | 60.61 | 60.06 |
| 04/07/2018 | 59.39 | 60.53 | 59.96 |
| 05/07/2018 | 59.53 | 60.69 | 60.11 |
| 06/07/2018 | 59.42 | 60.6 | 60.01 |
| 09/07/2018 | 59.59 | 60.82 | 60.21 |
| 10/07/2018 | 59.45 | 60.63 | 60.04 |
| 11/07/2018 | 59.42 | 60.48 | 59.95 |
| 12/07/2018 | 59.59 | 60.73 | 60.16 |
| 13/07/2018 | 59.52 | 60.74 | 60.13 |
| 16/07/2018 | 59.42 | 60.66 | 60.04 |
| 17/07/2018 | 59.56 | 60.73 | 60.15 |
| 18/07/2018 | 59.48 | 60.65 | 60.07 |
| 19/07/2018 | 59.6 | 60.77 | 60.19 |
| 20/07/2018 | 59.48 | 60.71 | 60.1 |
| 23/07/2018 | 59.35 | 60.45 | 59.9 |
| 24/07/2018 | 59.13 | 60.33 | 59.73 |
| 25/07/2018 | 58.96 | 60.25 | 59.61 |
| 26/07/2018 | 58.85 | 60.06 | 59.46 |
| 27/07/2018 | 58.58 | 59.78 | 59.18 |
| 30/07/2018 | 58.6 | 59.88 | 59.24 |
| 31/07/2018 | 58.26 | 59.47 | 58.87 |
| 01/08/2018 | 58.52 | 59.8 | 59.16 |
| 02/08/2018 | 58.51 | 59.74 | 59.13 |
| 03/08/2018 | 58.31 | 59.55 | 58.93 |
| 06/08/2018 | 58.3 | 59.6 | 58.95 |
| 07/08/2018 | 58.14 | 59.24 | 58.69 |
| 08/08/2018 | 58.59 | 59.62 | 59.11 |
| 09/08/2018 | 58.13 | 59.39 | 58.76 |
| 10/08/2018 | 58.4 | 59.51 | 58.96 |
| 13/08/2018 | 58.32 | 59.47 | 58.9 |
| 14/08/2018 | 58.23 | 59.4 | 58.82 |
| 15/08/2018 | 58.52 | 59.7 | 59.11 |
| 16/08/2018 | 58.5 | 59.68 | 59.09 |
| 17/08/2018 | 58.82 | 59.93 | 59.38 |
| 20/08/2018 | 58.97 | 60.11 | 59.54 |
| 21/08/2018 | 59.19 | 60.33 | 59.76 |
| 22/08/2018 | 59.03 | 60.22 | 59.63 |
| 23/08/2018 | 59.09 | 60.25 | 59.67 |
| 24/08/2018 | 59.2 | 60.3 | 59.75 |
| 27/08/2018 | 58.84 | 60.12 | 59.48 |
| 28/08/2018 | 58.94 | 60.04 | 59.49 |
| 29/08/2018 | 59.25 | 60.27 | 59.76 |
| 30/08/2018 | 59.11 | 60.4 | 59.76 |
| 31/08/2018 | 59.54 | 60.78 | 60.16 |
| 03/09/2018 | 59.32 | 60.47 | 59.9 |
| 04/09/2018 | 59.48 | 60.6 | 60.04 |
| 05/09/2018 | 59.59 | 60.81 | 60.2 |
| 06/09/2018 | 59.8 | 60.94 | 60.37 |
| 10/09/2018 | 59.79 | 60.93 | 60.36 |
| 11/09/2018 | 59.78 | 60.97 | 60.38 |
| 12/09/2018 | 59.83 | 60.96 | 60.4 |
| 13/09/2018 | 59.61 | 60.83 | 60.22 |
| 14/09/2018 | 60.12 | 61.35 | 60.74 |
| 17/09/2018 | 60.26 | 61.35 | 60.81 |
| 18/09/2018 | 60.27 | 61.49 | 60.88 |
| 19/09/2018 | 60.59 | 61.83 | 61.21 |
| 20/09/2018 | 60.78 | 61.88 | 61.33 |
| 21/09/2018 | 60.76 | 61.84 | 61.3 |
| 24/09/2018 | 60.48 | 61.65 | 61.07 |
| 26/09/2018 | 60.24 | 61.58 | 60.91 |
| 27/09/2018 | 60.2 | 61.51 | 60.86 |
| 28/09/2018 | 60.26 | 61.48 | 60.87 |
| 01/10/2018 | 60.21 | 61.36 | 60.79 |
| 02/10/2018 | 60.16 | 61.39 | 60.78 |
| 03/10/2018 | 60.17 | 61.39 | 60.78 |
| 05/10/2018 | 60.18 | 61.38 | 60.78 |
| 08/10/2018 | 60.16 | 61.38 | 60.77 |
| 09/10/2018 | 60.14 | 61.32 | 60.73 |
| 11/10/2018 | 60.27 | 61.43 | 60.85 |
| 12/10/2018 | 60.15 | 61.3 | 60.73 |
| 15/10/2018 | 60.1 | 61.32 | 60.71 |
| 16/10/2018 | 60.54 | 61.72 | 61.13 |
| 17/10/2018 | 60.34 | 61.57 | 60.96 |
| 18/10/2018 | 60.54 | 61.62 | 61.08 |
| 19/10/2018 | 60.51 | 61.64 | 61.08 |
| 22/10/2018 | 60.6 | 61.78 | 61.19 |
| 23/10/2018 | 60.45 | 61.59 | 61.02 |
| 24/10/2018 | 60.52 | 61.77 | 61.15 |
| 25/10/2018 | 60.54 | 61.7 | 61.12 |
| 26/10/2018 | 60.46 | 61.72 | 61.09 |
| 29/10/2018 | 60.68 | 61.87 | 61.28 |
| 30/10/2018 | 60.66 | 61.82 | 61.24 |
| 31/10/2018 | 60.38 | 61.7 | 61.04 |
| 01/11/2018 | 60.58 | 61.81 | 61.2 |
| 02/11/2018 | 60.65 | 61.8 | 61.23 |
| 05/11/2018 | 60.59 | 61.8 | 61.2 |
| 06/11/2018 | 60.58 | 61.81 | 61.2 |
| 07/11/2018 | 60.58 | 61.81 | 61.2 |
| 08/11/2018 | 60.54 | 61.72 | 61.13 |
| 09/11/2018 | 60.64 | 61.74 | 61.19 |
| 12/11/2018 | 60.67 | 61.83 | 61.25 |
| 13/11/2018 | 60.73 | 61.92 | 61.33 |
| 14/11/2018 | 60.55 | 61.63 | 61.09 |
| 15/11/2018 | 60.49 | 61.67 | 61.08 |
| 16/11/2018 | 60.67 | 61.83 | 61.25 |
| 19/11/2018 | 60.63 | 61.86 | 61.25 |
| 20/11/2018 | 60.64 | 61.76 | 61.2 |
| 21/11/2018 | 60.74 | 61.77 | 61.26 |
| 22/11/2018 | 60.81 | 61.98 | 61.4 |
| 23/11/2018 | 60.46 | 61.72 | 61.09 |
| 26/11/2018 | 60.53 | 61.68 | 61.11 |
| 27/11/2018 | 60.73 | 61.86 | 61.3 |
| 28/11/2018 | 60.7 | 61.87 | 61.29 |
| 29/11/2018 | 60.7 | 61.84 | 61.27 |
| 30/11/2018 | 60.88 | 62.05 | 61.47 |
| 03/12/2018 | 60.79 | 62.04 | 61.42 |
| 04/12/2018 | 60.95 | 62.12 | 61.54 |
| 05/12/2018 | 60.69 | 62.01 | 61.35 |
| 06/12/2018 | 61.03 | 62.13 | 61.58 |
| 07/12/2018 | 60.65 | 61.9 | 61.28 |
| 10/12/2018 | 60.96 | 62.18 | 61.57 |
| 11/12/2018 | 60.99 | 62.13 | 61.56 |
| 12/12/2018 | 60.9 | 62.06 | 61.48 |
| 13/12/2018 | 61.03 | 62.18 | 61.61 |
| 14/12/2018 | 60.92 | 62.12 | 61.52 |
| 17/12/2018 | 60.99 | 62.11 | 61.55 |
| 18/12/2018 | 61.08 | 62.2 | 61.64 |
| 19/12/2018 | 60.92 | 62.03 | 61.48 |
| 20/12/2018 | 61 | 62.16 | 61.58 |
| 21/12/2018 | 60.98 | 62.18 | 61.58 |
| 24/12/2018 | 60.82 | 62.02 | 61.42 |
| 26/12/2018 | 61.05 | 62.25 | 61.65 |
| 27/12/2018 | 61.03 | 62.3 | 61.67 |
| 28/12/2018 | 60.97 | 62.17 | 61.57 |
| 31/12/2018 | 60.87 | 62.13 | 61.5 |
| 02/01/2019 | 60.86 | 62.08 | 61.47 |
| 03/01/2019 | 60.89 | 62.05 | 61.47 |
| 04/01/2019 | 61.36 | 62.37 | 61.87 |
| 07/01/2019 | 61.37 | 62.55 | 61.96 |
| 08/01/2019 | 61.34 | 62.47 | 61.91 |
| 09/01/2019 | 61.36 | 62.49 | 61.93 |
| 10/01/2019 | 61.45 | 62.65 | 62.05 |
| 11/01/2019 | 61.67 | 62.85 | 62.26 |
| 14/01/2019 | 61.67 | 62.86 | 62.27 |
| 15/01/2019 | 61.66 | 62.88 | 62.27 |
| 16/01/2019 | 61.84 | 63.04 | 62.44 |
| 17/01/2019 | 61.91 | 63.04 | 62.48 |
| 18/01/2019 | 61.91 | 63.15 | 62.53 |
| 21/01/2019 | 61.84 | 63.05 | 62.45 |
| 22/01/2019 | 62.07 | 63.27 | 62.67 |
| 23/01/2019 | 61.94 | 63.15 | 62.55 |
| 24/01/2019 | 62.14 | 63.4 | 62.77 |
| 25/01/2019 | 62.16 | 63.33 | 62.75 |
| 28/01/2019 | 62.12 | 63.33 | 62.73 |
| 29/01/2019 | 62.19 | 63.34 | 62.77 |
| 30/01/2019 | 62.06 | 63.28 | 62.67 |
| 31/01/2019 | 62.25 | 63.45 | 62.85 |
| 01/02/2019 | 62.12 | 63.32 | 62.72 |
| 05/02/2019 | 62.19 | 63.36 | 62.78 |
| 06/02/2019 | 62.2 | 63.44 | 62.82 |
| 07/02/2019 | 62.23 | 63.43 | 62.83 |
| 08/02/2019 | 62.16 | 63.38 | 62.77 |
| 11/02/2019 | 62.45 | 63.59 | 63.02 |
| 12/02/2019 | 62.5 | 63.75 | 63.13 |
| 13/02/2019 | 62.27 | 63.55 | 62.91 |
| 14/02/2019 | 62.28 | 63.43 | 62.86 |
| 15/02/2019 | 62.35 | 63.56 | 62.96 |
| 18/02/2019 | 62.41 | 63.66 | 63.04 |
| 19/02/2019 | 62.4 | 63.62 | 63.01 |
| 20/02/2019 | 62.43 | 63.64 | 63.04 |
| 21/02/2019 | 62.51 | 63.75 | 63.13 |
| 22/02/2019 | 62.56 | 63.82 | 63.19 |
| 25/02/2019 | 62.78 | 63.96 | 63.37 |
| 26/02/2019 | 62.33 | 63.63 | 62.98 |
| 27/02/2019 | 62.53 | 63.78 | 63.16 |
| 28/02/2019 | 62.56 | 63.73 | 63.15 |
| 01/03/2019 | 62.82 | 64.05 | 63.44 |
| 04/03/2019 | 62.97 | 64.2 | 63.59 |
| 05/03/2019 | 63.04 | 64.27 | 63.66 |
| 06/03/2019 | 62.62 | 63.73 | 63.18 |
| 07/03/2019 | 62.84 | 63.97 | 63.41 |
| 08/03/2019 | 63.11 | 64.37 | 63.74 |
| 11/03/2019 | 63.14 | 64.41 | 63.78 |
| 12/03/2019 | 63.18 | 64.41 | 63.8 |
| 13/03/2019 | 63.06 | 64.27 | 63.67 |
| 14/03/2019 | 63.19 | 64.44 | 63.82 |
| 15/03/2019 | 63.09 | 64.41 | 63.75 |
| 18/03/2019 | 63.4 | 64.68 | 64.04 |
| 19/03/2019 | 63.26 | 64.5 | 63.88 |
| 20/03/2019 | 63.48 | 64.74 | 64.11 |
| 21/03/2019 | 63.2 | 64.3 | 63.75 |
| 22/03/2019 | 63.81 | 65.09 | 64.45 |
| 25/03/2019 | 63.97 | 65.12 | 64.55 |
| 26/03/2019 | 63.75 | 64.95 | 64.35 |
| 27/03/2019 | 63.75 | 64.9 | 64.33 |
| 28/03/2019 | 63.9 | 65.17 | 64.54 |
| 29/03/2019 | 64.11 | 65.37 | 64.74 |
| 01/04/2019 | 63.91 | 65.18 | 64.55 |
| 02/04/2019 | 64.13 | 65.33 | 64.73 |
| 03/04/2019 | 63.75 | 65.04 | 64.4 |
| 04/04/2019 | 64.13 | 65.36 | 64.75 |
| 05/04/2019 | 64.33 | 65.54 | 64.94 |
| 09/04/2019 | 64.05 | 65.26 | 64.66 |
| 10/04/2019 | 64.37 | 65.61 | 64.99 |
| 11/04/2019 | 64.34 | 65.56 | 64.95 |
| 12/04/2019 | 64.45 | 65.71 | 65.08 |
| 15/04/2019 | 64.67 | 66 | 65.34 |
| 16/04/2019 | 64.43 | 65.62 | 65.03 |
| 17/04/2019 | 64.92 | 66.1 | 65.51 |
| 18/04/2019 | 64.87 | 66.19 | 65.53 |
| 22/04/2019 | 64.68 | 65.91 | 65.3 |
| 23/04/2019 | 64.85 | 66.16 | 65.51 |
| 24/04/2019 | 64.71 | 66.05 | 65.38 |
| 25/04/2019 | 64.69 | 65.9 | 65.3 |
| 26/04/2019 | 64.92 | 66.1 | 65.51 |
| 29/04/2019 | 64.71 | 66.01 | 65.36 |
| 30/04/2019 | 64.87 | 66.19 | 65.53 |
| 02/05/2019 | 64.95 | 66.21 | 65.58 |
| 03/05/2019 | 64.85 | 66.1 | 65.48 |
| 06/05/2019 | 64.81 | 66.12 | 65.47 |
| 07/05/2019 | 64.71 | 65.92 | 65.32 |
| 08/05/2019 | 64.8 | 66.08 | 65.44 |
| 09/05/2019 | 64.65 | 65.96 | 65.31 |
| 10/05/2019 | 64.68 | 65.96 | 65.32 |
| 13/05/2019 | 64.67 | 65.91 | 65.29 |
| 14/05/2019 | 64.42 | 65.66 | 65.04 |
| 15/05/2019 | 64.67 | 65.83 | 65.25 |
| 16/05/2019 | 64.44 | 65.62 | 65.03 |
| 17/05/2019 | 64.48 | 65.74 | 65.11 |
| 20/05/2019 | 64.35 | 65.55 | 64.95 |
| 21/05/2019 | 64.1 | 65.3 | 64.7 |
| 22/05/2019 | 64.13 | 65.42 | 64.78 |
| 23/05/2019 | 64.09 | 65.23 | 64.66 |
| 24/05/2019 | 62.67 | 63.87 | 63.27 |
| 27/05/2019 | 62.12 | 63.61 | 62.87 |
| 28/05/2019 | 62.17 | 63.54 | 62.86 |
| 29/05/2019 | 61.65 | 62.93 | 62.29 |
| 30/05/2019 | 62.89 | 64.07 | 63.48 |
| 31/05/2019 | 62.26 | 63.59 | 62.93 |
| 03/06/2019 | 62.55 | 63.85 | 63.2 |
| 04/06/2019 | 62.13 | 63.4 | 62.77 |
| 05/06/2019 | 62.46 | 63.77 | 63.12 |
| 06/06/2019 | 62.14 | 63.35 | 62.75 |
| 07/06/2019 | 62.32 | 63.55 | 62.94 |
| 10/06/2019 | 62.08 | 63.28 | 62.68 |
| 11/06/2019 | 62.4 | 63.61 | 63.01 |
| 12/06/2019 | 62.44 | 63.61 | 63.03 |
| 13/06/2019 | 62.44 | 63.63 | 63.04 |
| 14/06/2019 | 62.64 | 63.84 | 63.24 |
| 17/06/2019 | 62.57 | 63.73 | 63.15 |
| 18/06/2019 | 62.63 | 63.82 | 63.23 |
| 19/06/2019 | 62.82 | 64.06 | 63.44 |
| 20/06/2019 | 62.84 | 63.97 | 63.41 |
| 21/06/2019 | 62.54 | 63.79 | 63.17 |
| 24/06/2019 | 62.61 | 63.78 | 63.2 |
| 26/06/2019 | 62.43 | 63.66 | 63.05 |
| 27/06/2019 | 62.35 | 63.58 | 62.97 |
| 28/06/2019 | 62.51 | 63.7 | 63.11 |
| 01/07/2019 | 62.43 | 63.64 | 63.04 |
| 02/07/2019 | 62.54 | 63.68 | 63.11 |
| 03/07/2019 | 62.43 | 63.69 | 63.06 |
| 04/07/2019 | 62.44 | 63.65 | 63.05 |
| 05/07/2019 | 62.51 | 63.73 | 63.12 |
| 08/07/2019 | 62.65 | 63.88 | 63.27 |
| 09/07/2019 | 62.63 | 63.84 | 63.24 |
| 10/07/2019 | 62.56 | 63.8 | 63.18 |
| 11/07/2019 | 62.49 | 63.68 | 63.09 |
| 12/07/2019 | 62.54 | 63.75 | 63.15 |
| 15/07/2019 | 62.63 | 63.8 | 63.22 |
| 16/07/2019 | 62.43 | 63.61 | 63.02 |
| 17/07/2019 | 62.45 | 63.71 | 63.08 |
| 18/07/2019 | 62.5 | 63.68 | 63.09 |
| 19/07/2019 | 62.57 | 63.77 | 63.17 |
| 22/07/2019 | 62.51 | 63.74 | 63.13 |
| 23/07/2019 | 62.63 | 63.75 | 63.19 |
| 24/07/2019 | 62.52 | 63.76 | 63.14 |
| 25/07/2019 | 62.48 | 63.74 | 63.11 |
| 26/07/2019 | 62.33 | 63.55 | 62.94 |
| 29/07/2019 | 62.28 | 63.55 | 62.92 |
| 30/07/2019 | 62.3 | 63.58 | 62.94 |
| 31/07/2019 | 62.43 | 63.62 | 63.03 |
| 01/08/2019 | 62.25 | 63.4 | 62.83 |
| 02/08/2019 | 62.04 | 63.27 | 62.66 |
| 05/08/2019 | 62.13 | 63.27 | 62.7 |
| 06/08/2019 | 62.03 | 63.28 | 62.66 |
| 07/08/2019 | 62.03 | 63.21 | 62.62 |
| 08/08/2019 | 62.06 | 63.33 | 62.7 |
| 09/08/2019 | 61.88 | 63.12 | 62.5 |
| 12/08/2019 | 62.21 | 63.24 | 62.73 |
| 13/08/2019 | 61.74 | 62.93 | 62.34 |
| 14/08/2019 | 61.7 | 62.83 | 62.27 |
| 15/08/2019 | 61.46 | 62.77 | 62.12 |
| 16/08/2019 | 61.48 | 62.67 | 62.08 |
| 19/08/2019 | 61.54 | 62.67 | 62.11 |
| 20/08/2019 | 61.77 | 62.99 | 62.38 |
| 21/08/2019 | 61.42 | 62.68 | 62.05 |
| 22/08/2019 | 61.26 | 62.61 | 61.94 |
| 23/08/2019 | 61.5 | 62.65 | 62.08 |
| 26/08/2019 | 61.54 | 62.71 | 62.13 |
| 27/08/2019 | 61.34 | 62.51 | 61.93 |
| 28/08/2019 | 61.57 | 62.83 | 62.2 |
| 29/08/2019 | 61.41 | 62.56 | 61.99 |
| 30/08/2019 | 61.67 | 62.68 | 62.18 |
| 02/09/2019 | 61.56 | 62.75 | 62.16 |
| 03/09/2019 | 61.63 | 62.88 | 62.26 |
| 04/09/2019 | 61.63 | 62.81 | 62.22 |
| 05/09/2019 | 61.68 | 62.93 | 62.31 |
| 09/09/2019 | 61.97 | 63.02 | 62.5 |
| 10/09/2019 | 61.76 | 63.1 | 62.43 |
| 11/09/2019 | 62.02 | 63.19 | 62.61 |
| 12/09/2019 | 62.19 | 63.48 | 62.84 |
| 13/09/2019 | 62.2 | 63.38 | 62.79 |
| 16/09/2019 | 62.41 | 63.59 | 63 |
| 17/09/2019 | 62.37 | 63.57 | 62.97 |
| 18/09/2019 | 62.15 | 63.42 | 62.79 |
| 19/09/2019 | 62.28 | 63.53 | 62.91 |
| 20/09/2019 | 62.24 | 63.43 | 62.84 |
| 23/09/2019 | 62.15 | 63.31 | 62.73 |
| 24/09/2019 | 62.69 | 63.94 | 63.32 |
| 26/09/2019 | 62.17 | 63.36 | 62.77 |
| 27/09/2019 | 62.04 | 63.25 | 62.65 |
| 30/09/2019 | 62.01 | 63.2 | 62.61 |
| 01/10/2019 | 62.49 | 63.69 | 63.09 |
| 02/10/2019 | 62.36 | 63.29 | 62.83 |
| 03/10/2019 | 62.68 | 63.87 | 63.28 |
| 07/10/2019 | 62.5 | 63.67 | 63.09 |
| 08/10/2019 | 62.34 | 63.68 | 63.01 |
| 09/10/2019 | 62.23 | 63.45 | 62.84 |
| 10/10/2019 | 62.35 | 63.42 | 62.89 |
| 11/10/2019 | 62.87 | 64.05 | 63.46 |
| 14/10/2019 | 62.77 | 63.95 | 63.36 |
| 16/10/2019 | 62.62 | 63.79 | 63.21 |
| 17/10/2019 | 62.73 | 64.02 | 63.38 |
| 18/10/2019 | 62.65 | 63.85 | 63.25 |
| 21/10/2019 | 62.7 | 63.82 | 63.26 |
| 22/10/2019 | 62.51 | 63.7 | 63.11 |
| 23/10/2019 | 62.91 | 64.13 | 63.52 |
| 24/10/2019 | 62.73 | 63.95 | 63.34 |
| 25/10/2019 | 63.01 | 64.22 | 63.62 |
| 28/10/2019 | 62.74 | 63.84 | 63.29 |
| 29/10/2019 | 62.65 | 63.85 | 63.25 |
| 30/10/2019 | 62.98 | 64.14 | 63.56 |
| 31/10/2019 | 62.94 | 64.18 | 63.56 |
| 01/11/2019 | 63.41 | 64.6 | 64.01 |
| 04/11/2019 | 63.04 | 64.2 | 63.62 |
| 05/11/2019 | 63.05 | 64.26 | 63.66 |
| 06/11/2019 | 63.22 | 64.43 | 63.83 |
| 07/11/2019 | 63.41 | 64.63 | 64.02 |
| 08/11/2019 | 63.41 | 64.62 | 64.02 |
| 11/11/2019 | 63.41 | 64.64 | 64.03 |
| 12/11/2019 | 63.42 | 64.65 | 64.04 |
| 13/11/2019 | 63.72 | 64.93 | 64.33 |
| 14/11/2019 | 63.89 | 65.16 | 64.53 |
| 15/11/2019 | 63.64 | 64.88 | 64.26 |
| 18/11/2019 | 63.83 | 64.89 | 64.36 |
| 19/11/2019 | 64.06 | 65.4 | 64.73 |
| 20/11/2019 | 64.06 | 65.26 | 64.66 |
| 21/11/2019 | 64.05 | 65.33 | 64.69 |
| 22/11/2019 | 64.23 | 65.45 | 64.84 |
| 25/11/2019 | 63.9 | 65.11 | 64.51 |
| 26/11/2019 | 64.05 | 65.32 | 64.69 |
| 27/11/2019 | 64.13 | 65.39 | 64.76 |
| 28/11/2019 | 64.21 | 65.36 | 64.79 |
| 29/11/2019 | 64.28 | 65.57 | 64.93 |
| 02/12/2019 | 64.28 | 65.55 | 64.92 |
| 03/12/2019 | 64.16 | 65.35 | 64.76 |
| 04/12/2019 | 64.36 | 65.49 | 64.93 |
| 05/12/2019 | 64.26 | 65.52 | 64.89 |
| 06/12/2019 | 64.38 | 65.61 | 65 |
| 09/12/2019 | 64.39 | 65.61 | 65 |
| 10/12/2019 | 64.65 | 65.78 | 65.22 |
| 11/12/2019 | 64.35 | 65.64 | 65 |
| 12/12/2019 | 64.1 | 65.35 | 64.73 |
| 13/12/2019 | 64.27 | 65.55 | 64.91 |
| 16/12/2019 | 63.91 | 65.13 | 64.52 |
| 17/12/2019 | 63.86 | 65.08 | 64.47 |
| 18/12/2019 | 64 | 65.25 | 64.63 |
| 19/12/2019 | 63.64 | 64.76 | 64.2 |
| 20/12/2019 | 63.69 | 64.98 | 64.34 |
| 23/12/2019 | 63.68 | 64.93 | 64.31 |
| 24/12/2019 | 63.53 | 64.79 | 64.16 |
| 26/12/2019 | 63.83 | 65.05 | 64.44 |
| 27/12/2019 | 63.45 | 64.73 | 64.09 |
| 30/12/2019 | 63.37 | 64.62 | 64 |
| 31/12/2019 | 63.6 | 64.83 | 64.22 |
| 02/01/2020 | 63.33 | 64.64 | 63.99 |
| 03/01/2020 | 63.48 | 64.71 | 64.1 |
| 06/01/2020 | 63.6 | 64.84 | 64.22 |
| 07/01/2020 | 63.51 | 64.68 | 64.1 |
| 08/01/2020 | 63.3 | 64.52 | 63.91 |
| 09/01/2020 | 63.38 | 64.54 | 63.96 |
| 10/01/2020 | 63.61 | 64.84 | 64.23 |
| 13/01/2020 | 63.89 | 65.14 | 64.52 |
| 14/01/2020 | 63.75 | 64.96 | 64.36 |
| 16/01/2020 | 64.26 | 65.51 | 64.89 |
| 17/01/2020 | 64.1 | 65.33 | 64.72 |
| 20/01/2020 | 63.94 | 65.09 | 64.52 |
| 21/01/2020 | 64.26 | 65.49 | 64.88 |
| 22/01/2020 | 64.42 | 65.59 | 65.01 |
| 23/01/2020 | 64.22 | 65.48 | 64.85 |
| 24/01/2020 | 64.47 | 65.68 | 65.08 |
| 27/01/2020 | 64.45 | 65.66 | 65.06 |
| 28/01/2020 | 64.44 | 65.68 | 65.06 |
| 29/01/2020 | 64.65 | 65.84 | 65.25 |
| 30/01/2020 | 64.72 | 65.94 | 65.33 |
| 31/01/2020 | 64.56 | 65.82 | 65.19 |
| 04/02/2020 | 64.45 | 65.73 | 65.09 |
| 05/02/2020 | 65.13 | 66.11 | 65.62 |
| 06/02/2020 | 64.79 | 66.2 | 65.5 |
| 07/02/2020 | 64.75 | 65.89 | 65.32 |
| 10/02/2020 | 65.21 | 66.58 | 65.9 |
| 11/02/2020 | 64.88 | 66.1 | 65.49 |
| 12/02/2020 | 65.12 | 66.36 | 65.74 |
| 13/02/2020 | 64.77 | 66.08 | 65.43 |
| 14/02/2020 | 64.93 | 66.17 | 65.55 |
| 17/02/2020 | 64.99 | 66.31 | 65.65 |
| 18/02/2020 | 65.35 | 66.56 | 65.96 |
| 19/02/2020 | 64.86 | 66 | 65.43 |
| 20/02/2020 | 65.04 | 66.19 | 65.62 |
| 21/02/2020 | 65.33 | 66.62 | 65.98 |
| 24/02/2020 | 65.32 | 66.56 | 65.94 |
| 25/02/2020 | 65.6 | 66.79 | 66.2 |
| 26/02/2020 | 65.13 | 66.38 | 65.76 |
| 27/02/2020 | 65.42 | 66.63 | 66.03 |
| 28/02/2020 | 65.99 | 67.26 | 66.63 |
| 02/03/2020 | 65.86 | 67.16 | 66.51 |
| 03/03/2020 | 65.57 | 67.11 | 66.34 |
| 04/03/2020 | 66.48 | 67.81 | 67.15 |
| 05/03/2020 | 66.31 | 67.14 | 66.73 |
| 06/03/2020 | 66.59 | 67.85 | 67.22 |
| 09/03/2020 | 66.59 | 67.88 | 67.24 |
| 10/03/2020 | 66.09 | 67.38 | 66.74 |
| 11/03/2020 | 66.43 | 68.05 | 67.24 |
| 12/03/2020 | 66.71 | 67.88 | 67.3 |
| 13/03/2020 | 67.12 | 68.37 | 67.75 |
| 16/03/2020 | 66.84 | 68.11 | 67.48 |
| 17/03/2020 | 66.94 | 68.35 | 67.65 |
| 18/03/2020 | 66.38 | 67.62 | 67 |
| 19/03/2020 | 67.48 | 68.7 | 68.09 |
| 20/03/2020 | 67.79 | 69.13 | 68.46 |
| 23/03/2020 | 67.45 | 68.64 | 68.05 |
| 24/03/2020 | 66.59 | 68.05 | 67.32 |
| 25/03/2020 | 67.79 | 69.06 | 68.43 |
| 26/03/2020 | 68 | 69.29 | 68.65 |
| 27/03/2020 | 67.49 | 68.65 | 68.07 |
| 30/03/2020 | 67.26 | 68.6 | 67.93 |
| 31/03/2020 | 67.75 | 68.81 | 68.28 |
| 01/04/2020 | 67.39 | 68.58 | 67.99 |
| 02/04/2020 | 67.47 | 69.04 | 68.26 |
| 03/04/2020 | 68.46 | 68.82 | 68.64 |
| 06/04/2020 | 66.86 | 68.65 | 67.76 |
| 08/04/2020 | 66.73 | 68.39 | 67.56 |
| 09/04/2020 | 67.25 | 68.72 | 67.99 |
| 13/04/2020 | 68.75 | 70.02 | 69.39 |
| 14/04/2020 | 68.61 | 70.31 | 69.46 |
| 15/04/2020 | 68.35 | 69.72 | 69.04 |
| 16/04/2020 | 68.78 | 70 | 69.39 |
| 17/04/2020 | 68.24 | 69.74 | 68.99 |
| 20/04/2020 | 68.85 | 70.24 | 69.55 |
| 21/04/2020 | 68.65 | 70.01 | 69.33 |
| 22/04/2020 | 69.57 | 71.18 | 70.38 |
| 23/04/2020 | 68.93 | 70.2 | 69.57 |
| 24/04/2020 | 69.24 | 70.46 | 69.85 |
| 27/04/2020 | 68.59 | 70.34 | 69.47 |
| 28/04/2020 | 69.54 | 70.27 | 69.91 |
| 29/04/2020 | 69.96 | 71.4 | 70.68 |
| 30/04/2020 | 69.1 | 70.5 | 69.8 |
| 04/05/2020 | 68.79 | 70.2 | 69.5 |
| 05/05/2020 | 69.11 | 70.57 | 69.84 |
| 06/05/2020 | 68.56 | 69.79 | 69.18 |
| 07/05/2020 | 69.19 | 70.53 | 69.86 |
| 08/05/2020 | 69.44 | 70.61 | 70.03 |
| 11/05/2020 | 68.75 | 70.13 | 69.44 |
| 12/05/2020 | 69.21 | 70.56 | 69.89 |
| 13/05/2020 | 69.55 | 70.53 | 70.04 |
| 14/05/2020 | 69.49 | 70.72 | 70.11 |
| 15/05/2020 | 69.11 | 70.47 | 69.79 |
| 18/05/2020 | 69.44 | 71.02 | 70.23 |
| 19/05/2020 | 69.29 | 70.59 | 69.94 |
| 20/05/2020 | 69.27 | 70.69 | 69.98 |
| 21/05/2020 | 69.75 | 71.33 | 70.54 |
| 22/05/2020 | 69.02 | 70.09 | 69.56 |
| 25/05/2020 | 69.79 | 70.7 | 70.25 |
| 26/05/2020 | 69.67 | 71.1 | 70.39 |
| 27/05/2020 | 69.21 | 70.88 | 70.05 |
| 28/05/2020 | 69.54 | 70.95 | 70.25 |
| 29/05/2020 | 69.37 | 70.7 | 70.04 |
| 01/06/2020 | 69.49 | 70.24 | 69.87 |
| 02/06/2020 | 70.27 | 71.51 | 70.89 |
| 03/06/2020 | 69.71 | 71.45 | 70.58 |
| 04/06/2020 | 70.13 | 71.16 | 70.65 |
| 05/06/2020 | 70.13 | 71.3 | 70.72 |
| 08/06/2020 | 70.38 | 72.03 | 71.21 |
| 09/06/2020 | 70.23 | 71.62 | 70.93 |
| 10/06/2020 | 70.17 | 71.6 | 70.89 |
| 11/06/2020 | 70.25 | 71.61 | 70.93 |
| 12/06/2020 | 70.33 | 71.71 | 71.02 |
| 15/06/2020 | 70.42 | 71.54 | 70.98 |
| 16/06/2020 | 70.07 | 71.46 | 70.77 |
| 17/06/2020 | 70.38 | 71.48 | 70.93 |
| 18/06/2020 | 70.09 | 71.56 | 70.83 |
| 19/06/2020 | 70.36 | 71.64 | 71 |
| 22/06/2020 | 69.89 | 71.52 | 70.71 |
| 23/06/2020 | 70.09 | 71.48 | 70.79 |
| 24/06/2020 | 70.59 | 71.9 | 71.25 |
| 26/06/2020 | 70.22 | 71.59 | 70.91 |
| 29/06/2020 | 70.09 | 71.43 | 70.76 |
| 30/06/2020 | 70.12 | 71.52 | 70.82 |
| 01/07/2020 | 70.2 | 71.45 | 70.83 |
| 02/07/2020 | 70.45 | 71.76 | 71.11 |
| 03/07/2020 | 70.34 | 71.61 | 70.98 |
| 06/07/2020 | 70.26 | 71.55 | 70.91 |
| 07/07/2020 | 70.71 | 72.16 | 71.44 |
| 08/07/2020 | 70.42 | 71.71 | 71.07 |
| 09/07/2020 | 70.02 | 71.36 | 70.69 |
| 10/07/2020 | 70.43 | 71.82 | 71.13 |
| 13/07/2020 | 70.08 | 71.51 | 70.8 |
| 14/07/2020 | 70.69 | 72 | 71.35 |
| 15/07/2020 | 70.98 | 72.13 | 71.56 |
| 16/07/2020 | 70.24 | 71.59 | 70.92 |
| 17/07/2020 | 70.66 | 72.15 | 71.41 |
| 20/07/2020 | 70.76 | 72.14 | 71.45 |
| 21/07/2020 | 71.12 | 72.36 | 71.74 |
| 22/07/2020 | 70.7 | 72.33 | 71.52 |
| 23/07/2020 | 71.04 | 72.39 | 71.72 |
| 24/07/2020 | 71.26 | 72.45 | 71.86 |
| 27/07/2020 | 71.18 | 72.81 | 72 |
| 28/07/2020 | 71.79 | 73.06 | 72.43 |
| 29/07/2020 | 71.33 | 72.79 | 72.06 |
| 30/07/2020 | 71.71 | 72.9 | 72.31 |
| 31/07/2020 | 71.47 | 72.89 | 72.18 |
| 03/08/2020 | 71.66 | 72.78 | 72.22 |
| 04/08/2020 | 71.72 | 73.25 | 72.49 |
| 05/08/2020 | 71.3 | 72.84 | 72.07 |
| 06/08/2020 | 71.38 | 72.59 | 71.99 |
| 07/08/2020 | 71.53 | 73.03 | 72.28 |
| 10/08/2020 | 71.76 | 73.13 | 72.45 |
| 11/08/2020 | 71.94 | 73.2 | 72.57 |
| 12/08/2020 | 71.59 | 72.86 | 72.23 |
| 13/08/2020 | 71.95 | 73.49 | 72.72 |
| 14/08/2020 | 71.81 | 73.14 | 72.48 |
| 17/08/2020 | 71.93 | 73.46 | 72.7 |
| 18/08/2020 | 71.32 | 73.01 | 72.17 |
| 19/08/2020 | 71.57 | 72.9 | 72.24 |
| 20/08/2020 | 71.6 | 72.98 | 72.29 |
| 21/08/2020 | 72.05 | 73.28 | 72.67 |
| 24/08/2020 | 71.75 | 73.3 | 72.53 |
| 25/08/2020 | 71.65 | 72.91 | 72.28 |
| 26/08/2020 | 71.84 | 73.2 | 72.52 |
| 27/08/2020 | 71.51 | 72.99 | 72.25 |
| 28/08/2020 | 71.52 | 73.13 | 72.33 |
| 31/08/2020 | 71.96 | 73.36 | 72.66 |
| 01/09/2020 | 72.15 | 73.58 | 72.87 |
| 02/09/2020 | 71.77 | 73.1 | 72.44 |
| 03/09/2020 | 72.11 | 73.42 | 72.77 |
| 04/09/2020 | 72.06 | 73.43 | 72.75 |
| 08/09/2020 | 71.69 | 73.1 | 72.4 |
| 09/09/2020 | 72.05 | 73.48 | 72.77 |
| 10/09/2020 | 71.47 | 72.64 | 72.06 |
| 11/09/2020 | 72.5 | 73.89 | 73.2 |
| 14/09/2020 | 72.05 | 73.59 | 72.82 |
| 15/09/2020 | 71.78 | 73.04 | 72.41 |
| 16/09/2020 | 72.32 | 73.71 | 73.02 |
| 17/09/2020 | 72.6 | 73.77 | 73.19 |
| 18/09/2020 | 72.68 | 73.97 | 73.33 |
| 21/09/2020 | 72.31 | 73.68 | 73 |
| 22/09/2020 | 72.96 | 74.52 | 73.74 |
| 23/09/2020 | 72.86 | 74.27 | 73.57 |
| 24/09/2020 | 72.69 | 74.12 | 73.41 |
| 28/09/2020 | 72.96 | 74.12 | 73.54 |
| 29/09/2020 | 72.89 | 74.31 | 73.6 |
| 30/09/2020 | 72.64 | 74.13 | 73.39 |
| 01/10/2020 | 73.04 | 74.48 | 73.76 |
| 02/10/2020 | 73.02 | 74.34 | 73.68 |
| 06/10/2020 | 73.24 | 74.53 | 73.89 |
| 07/10/2020 | 72.44 | 74.18 | 73.31 |
| 08/10/2020 | 73.03 | 74.47 | 73.75 |
| 09/10/2020 | 72.96 | 74.24 | 73.6 |
| 12/10/2020 | 73.13 | 74.49 | 73.81 |
| 13/10/2020 | 73.11 | 74.6 | 73.86 |
| 14/10/2020 | 73.08 | 74.75 | 73.92 |
| 15/10/2020 | 72.71 | 74.02 | 73.37 |
| 16/10/2020 | 73.27 | 74.71 | 73.99 |
| 19/10/2020 | 73.09 | 74.41 | 73.75 |
| 20/10/2020 | 73.39 | 74.93 | 74.16 |
| 21/10/2020 | 73.42 | 74.89 | 74.16 |
| 22/10/2020 | 73.62 | 74.88 | 74.25 |
| 23/10/2020 | 74.45 | 75.95 | 75.2 |
| 26/10/2020 | 74.2 | 75.75 | 74.98 |
| 27/10/2020 | 74.2 | 75.62 | 74.91 |
| 28/10/2020 | 74.27 | 75.65 | 74.96 |
| 29/10/2020 | 74.19 | 75.66 | 74.93 |
| 30/10/2020 | 74.76 | 76.21 | 75.49 |
| 02/11/2020 | 74.66 | 76.24 | 75.45 |
| 03/11/2020 | 74.12 | 75.58 | 74.85 |
| 04/11/2020 | 74.79 | 76.46 | 75.63 |
| 05/11/2020 | 74.28 | 75.79 | 75.04 |
| 06/11/2020 | 74.98 | 76.35 | 75.67 |
| 09/11/2020 | 75.32 | 76.83 | 76.08 |
| 11/11/2020 | 74.95 | 76.44 | 75.7 |
| 12/11/2020 | 75.01 | 76.51 | 75.76 |
| 13/11/2020 | 75.22 | 76.68 | 75.95 |
| 16/11/2020 | 75.44 | 76.69 | 76.07 |
| 17/11/2020 | 75.15 | 76.87 | 76.01 |
| 18/11/2020 | 75.39 | 76.72 | 76.06 |
| 19/11/2020 | 75.28 | 76.71 | 76 |
| 20/11/2020 | 75.49 | 77.02 | 76.26 |
| 23/11/2020 | 75.46 | 76.83 | 76.15 |
| 24/11/2020 | 75.66 | 77.07 | 76.37 |
| 25/11/2020 | 75.82 | 77.33 | 76.58 |
| 26/11/2020 | 75.27 | 76.68 | 75.98 |
| 27/11/2020 | 75.82 | 77.3 | 76.56 |
| 30/11/2020 | 75.94 | 77.43 | 76.69 |
| 01/12/2020 | 75.88 | 77.28 | 76.58 |
| 02/12/2020 | 75.51 | 76.97 | 76.24 |
| 03/12/2020 | 76.33 | 77.87 | 77.1 |
| 04/12/2020 | 76 | 77.43 | 76.72 |
| 07/12/2020 | 75.96 | 77.48 | 76.72 |
| 08/12/2020 | 76.38 | 77.38 | 76.88 |
| 09/12/2020 | 75.84 | 77.28 | 76.56 |
| 10/12/2020 | 75.15 | 76.41 | 75.78 |
| 11/12/2020 | 76.62 | 78.2 | 77.41 |
| 14/12/2020 | 76.01 | 77.56 | 76.79 |
| 15/12/2020 | 76.29 | 77.77 | 77.03 |
| 16/12/2020 | 76.66 | 78.08 | 77.37 |
| 17/12/2020 | 76.23 | 77.58 | 76.91 |
| 18/12/2020 | 76.44 | 78.03 | 77.24 |
| 21/12/2020 | 76.34 | 77.84 | 77.09 |
| 22/12/2020 | 76.48 | 77.92 | 77.2 |
| 23/12/2020 | 76.46 | 78.04 | 77.25 |
| 28/12/2020 | 76.36 | 77.76 | 77.06 |
| 29/12/2020 | 76.42 | 78.08 | 77.25 |
| 30/12/2020 | 76.13 | 77.68 | 76.91 |
| 31/12/2020 | 76.41 | 77.97 | 77.19 |
| 04/01/2021 | 76.35 | 77.88 | 77.12 |
| 05/01/2021 | 76.38 | 77.85 | 77.12 |
| 06/01/2021 | 76.27 | 77.76 | 77.02 |
| 07/01/2021 | 76.49 | 77.96 | 77.23 |
| 08/01/2021 | 76.4 | 77.89 | 77.15 |
| 11/01/2021 | 76.17 | 77.56 | 76.87 |
| 12/01/2021 | 76.19 | 77.62 | 76.91 |
| 13/01/2021 | 76.05 | 77.52 | 76.79 |
| 14/01/2021 | 76.4 | 77.86 | 77.13 |
| 15/01/2021 | 76.33 | 77.81 | 77.07 |
| 18/01/2021 | 75.96 | 77.53 | 76.75 |
| 19/01/2021 | 76.36 | 77.91 | 77.14 |
| 20/01/2021 | 76.14 | 77.61 | 76.88 |
| 21/01/2021 | 76.26 | 77.73 | 77 |
| 22/01/2021 | 76.31 | 77.76 | 77.04 |
| 25/01/2021 | 76.4 | 78.07 | 77.24 |
| 26/01/2021 | 76.43 | 77.64 | 77.04 |
| 27/01/2021 | 76.47 | 77.81 | 77.14 |
| 28/01/2021 | 76.47 | 78 | 77.24 |
| 29/01/2021 | 76.58 | 78 | 77.29 |
| 01/02/2021 | 76.65 | 78.21 | 77.43 |
| 02/02/2021 | 76.67 | 78.19 | 77.43 |
| 04/02/2021 | 76.85 | 78.3 | 77.58 |
| 05/02/2021 | 76.99 | 78.54 | 77.77 |
| 08/02/2021 | 77.28 | 78.83 | 78.06 |
| 09/02/2021 | 76.28 | 77.98 | 77.13 |
| 10/02/2021 | 77.02 | 78.45 | 77.74 |
| 11/02/2021 | 76.88 | 78.44 | 77.66 |
| 12/02/2021 | 77.09 | 78.51 | 77.8 |
| 15/02/2021 | 77.5 | 78.82 | 78.16 |
| 16/02/2021 | 77.39 | 78.82 | 78.11 |
| 17/02/2021 | 77.34 | 78.96 | 78.15 |
| 18/02/2021 | 77.33 | 78.8 | 78.07 |
| 19/02/2021 | 77.5 | 79.03 | 78.27 |
| 22/02/2021 | 77.79 | 79.32 | 78.56 |
| 23/02/2021 | 77.49 | 79 | 78.25 |
| 24/02/2021 | 77.52 | 78.84 | 78.18 |
| 25/02/2021 | 77.59 | 79.07 | 78.33 |
| 26/02/2021 | 77.5 | 78.94 | 78.22 |
| 01/03/2021 | 77.34 | 78.33 | 77.84 |
| 02/03/2021 | 77.21 | 78.84 | 78.03 |
| 03/03/2021 | 77.26 | 78.82 | 78.04 |
| 04/03/2021 | 77.21 | 78.67 | 77.94 |
| 05/03/2021 | 76.45 | 77.85 | 77.15 |
| 08/03/2021 | 75.51 | 77.14 | 76.33 |
| 09/03/2021 | 75.05 | 76.67 | 75.86 |
| 10/03/2021 | 75.06 | 76.82 | 75.94 |
| 11/03/2021 | 74.98 | 76.31 | 75.65 |
| 12/03/2021 | 73.94 | 75.56 | 74.75 |
| 15/03/2021 | 74.77 | 76.02 | 75.4 |
| 16/03/2021 | 73.9 | 74.6 | 74.25 |
| 17/03/2021 | 74.25 | 76.5 | 75.38 |
| 18/03/2021 | 72.56 | 74.15 | 73.36 |
| 19/03/2021 | 72.15 | 73.59 | 72.87 |
| 22/03/2021 | 70.77 | 73.38 | 72.08 |
| 23/03/2021 | 70.06 | 71.82 | 70.94 |
| 24/03/2021 | 69.73 | 71.97 | 70.85 |
| 25/03/2021 | 69.56 | 71.96 | 70.76 |
| 26/03/2021 | 68.95 | 70.03 | 69.49 |
| 29/03/2021 | 67.72 | 69.16 | 68.44 |
| 30/03/2021 | 66.97 | 69.66 | 68.32 |
| 31/03/2021 | 65.45 | 70.01 | 67.73 |
| 01/04/2021 | 67.14 | 68.01 | 67.58 |
| 05/04/2021 | 65.24 | 67.85 | 66.55 |
| 06/04/2021 | 65.8 | 67.7 | 66.75 |
| 08/04/2021 | 66.2 | 67.3 | 66.75 |
| 09/04/2021 | 63.89 | 65.66 | 64.78 |
| 12/04/2021 | 60.54 | 61.81 | 61.18 |
| 13/04/2021 | 60.87 | 61.84 | 61.36 |
| 14/04/2021 | 59.49 | 61.27 | 60.38 |
| 15/04/2021 | 58.84 | 60.16 | 59.5 |
| 16/04/2021 | 59.32 | 60.45 | 59.89 |
| 19/04/2021 | 58.02 | 59.24 | 58.63 |
| 20/04/2021 | 60 | 60.5 | 60.25 |
| 21/04/2021 | 60.28 | 61.24 | 60.76 |
| 22/04/2021 | 59.58 | 61.09 | 60.34 |
| 23/04/2021 | 60.54 | 61.39 | 60.97 |
| 26/04/2021 | 61.12 | 62.49 | 61.81 |
| 27/04/2021 | 61.71 | 63.06 | 62.39 |
| 28/04/2021 | 62.72 | 64.19 | 63.46 |
| 29/04/2021 | 62.45 | 64.1 | 63.28 |
| 30/04/2021 | 63.2 | 64.14 | 63.67 |
| 03/05/2021 | 63.95 | 65.29 | 64.62 |
| 04/05/2021 | 62.17 | 63.88 | 63.03 |
| 05/05/2021 | 62.9 | 64.05 | 63.48 |
| 06/05/2021 | 64.79 | 66.06 | 65.43 |
| 07/05/2021 | 64.54 | 65.57 | 65.06 |
| 10/05/2021 | 64.36 | 65.61 | 64.99 |
| 11/05/2021 | 62.35 | 63.7 | 63.03 |
| 12/05/2021 | 64.08 | 65.41 | 64.75 |
| 13/05/2021 | 65.86 | 66.95 | 66.41 |
| 14/05/2021 | 64.95 | 65.96 | 65.46 |
| 17/05/2021 | 65.45 | 66.91 | 66.18 |
| 18/05/2021 | 64.92 | 65.49 | 65.21 |
| 19/05/2021 | 64.72 | 67.04 | 65.88 |
| 20/05/2021 | 65.58 | 65.47 | 65.53 |
| 21/05/2021 | 65.45 | 66.49 | 65.97 |
| 24/05/2021 | 63.74 | 65.64 | 64.69 |
| 25/05/2021 | 65.45 | 66.27 | 65.86 |
| 26/05/2021 | 65.32 | 66.72 | 66.02 |
| 27/05/2021 | 65.68 | 67.09 | 66.39 |
| 28/05/2021 | 65.66 | 66.91 | 66.29 |
| 31/05/2021 | 65.76 | 67.18 | 66.47 |
| 01/06/2021 | 65.71 | 66.92 | 66.32 |
| 02/06/2021 | 66.07 | 67.01 | 66.54 |
| 03/06/2021 | 65.22 | 66.68 | 65.95 |
| 04/06/2021 | 65.78 | 67.15 | 66.47 |
| 07/06/2021 | 66.29 | 67.54 | 66.92 |
| 08/06/2021 | 65.85 | 66.66 | 66.26 |
| 09/06/2021 | 66.47 | 68.11 | 67.29 |
| 10/06/2021 | 66.1 | 67.13 | 66.62 |
| 11/06/2021 | 66.28 | 67.71 | 67 |
| 14/06/2021 | 65.78 | 67.36 | 66.57 |
| 15/06/2021 | 66.45 | 67.7 | 67.08 |
| 16/06/2021 | 66.33 | 67.55 | 66.94 |
| 17/06/2021 | 65.84 | 66.99 | 66.42 |
| 18/06/2021 | 66.28 | 67.51 | 66.9 |
| 21/06/2021 | 66.74 | 68.09 | 67.42 |
| 22/06/2021 | 65.85 | 67.11 | 66.48 |
| 23/06/2021 | 66.03 | 67.45 | 66.74 |
| 24/06/2021 | 65.86 | 67.23 | 66.55 |
| 28/06/2021 | 65.99 | 67.24 | 66.62 |
| 29/06/2021 | 66.95 | 68.24 | 67.6 |
| 30/06/2021 | 65.59 | 66.95 | 66.27 |
| 01/07/2021 | 65.37 | 66.7 | 66.04 |
| 02/07/2021 | 66.31 | 67.59 | 66.95 |
| 05/07/2021 | 66.91 | 68.24 | 67.58 |
| 06/07/2021 | 65.95 | 67.47 | 66.71 |
| 07/07/2021 | 66.35 | 67.75 | 67.05 |
| 08/07/2021 | 66.59 | 67.87 | 67.23 |
| 09/07/2021 | 66.89 | 68.11 | 67.5 |
| 12/07/2021 | 66.84 | 68.4 | 67.62 |
| 13/07/2021 | 65.87 | 67.33 | 66.6 |
| 14/07/2021 | 66.85 | 68.16 | 67.51 |
| 15/07/2021 | 66.05 | 67.36 | 66.71 |
| 16/07/2021 | 66.19 | 67.52 | 66.86 |
| 19/07/2021 | 66.36 | 67.66 | 67.01 |
| 20/07/2021 | 66.57 | 67.9 | 67.24 |
| 21/07/2021 | 65.73 | 66.8 | 66.27 |
| 22/07/2021 | 65.25 | 66.71 | 65.98 |
| 23/07/2021 | 65.38 | 66.68 | 66.03 |
| 26/07/2021 | 66.01 | 67.36 | 66.69 |
| 27/07/2021 | 65.25 | 66.41 | 65.83 |
| 28/07/2021 | 65.18 | 66.53 | 65.86 |
| 29/07/2021 | 65.07 | 66.87 | 65.97 |
| 30/07/2021 | 64.96 | 66.01 | 65.49 |
| 02/08/2021 | 65.17 | 66.75 | 65.96 |
| 03/08/2021 | 65.39 | 67.14 | 66.27 |
| 04/08/2021 | 65.07 | 66.23 | 65.65 |
| 05/08/2021 | 65.32 | 66.5 | 65.91 |
| 06/08/2021 | 64.55 | 66.05 | 65.3 |
| 09/08/2021 | 65.09 | 66.06 | 65.58 |
| 10/08/2021 | 65.14 | 66.84 | 65.99 |
| 11/08/2021 | 65.19 | 66.49 | 65.84 |
| 12/08/2021 | 65.31 | 66.62 | 65.97 |
| 13/08/2021 | 65.81 | 67.17 | 66.49 |
| 16/08/2021 | 65.06 | 66.15 | 65.61 |
| 17/08/2021 | 65.27 | 66.43 | 65.85 |
| 18/08/2021 | 65.07 | 66.56 | 65.82 |
| 19/08/2021 | 65.87 | 67.11 | 66.49 |
| 20/08/2021 | 65.5 | 66.81 | 66.16 |
| 23/08/2021 | 65.38 | 66.6 | 65.99 |
| 24/08/2021 | 65.38 | 66.72 | 66.05 |
| 25/08/2021 | 65.09 | 66.44 | 65.77 |
| 26/08/2021 | 65.44 | 66.81 | 66.13 |
| 27/08/2021 | 65.35 | 66.58 | 65.97 |
| 30/08/2021 | 65.01 | 66.26 | 65.64 |
| 31/08/2021 | 65.03 | 66.37 | 65.7 |
| 01/09/2021 | 64.91 | 66.26 | 65.59 |
| 02/09/2021 | 65.07 | 66.4 | 65.74 |
| 03/09/2021 | 65.24 | 66.43 | 65.84 |
| 06/09/2021 | 65.1 | 66.36 | 65.73 |
| 08/09/2021 | 65.19 | 66.61 | 65.9 |
| 09/09/2021 | 65.25 | 66.23 | 65.74 |
| 10/09/2021 | 65.67 | 66.9 | 66.29 |
| 13/09/2021 | 65.11 | 66.63 | 65.87 |
| 14/09/2021 | 65.72 | 66.98 | 66.35 |
| 15/09/2021 | 65.84 | 67.23 | 66.54 |
| 16/09/2021 | 65.5 | 66.72 | 66.11 |
| 17/09/2021 | 65.83 | 67.08 | 66.46 |
| 20/09/2021 | 65.92 | 67.2 | 66.56 |
| 21/09/2021 | 65.6 | 66.89 | 66.25 |
| 22/09/2021 | 65.69 | 66.98 | 66.34 |
| 23/09/2021 | 65.4 | 66.4 | 65.9 |
| 24/09/2021 | 65.51 | 66.92 | 66.22 |
| 27/09/2021 | 65.41 | 66.82 | 66.12 |
| 28/09/2021 | 65.84 | 66.85 | 66.35 |
| 29/09/2021 | 65.84 | 66.99 | 66.42 |
| 30/09/2021 | 65.39 | 66.68 | 66.04 |
| 01/10/2021 | 65.73 | 66.79 | 66.26 |
| 05/10/2021 | 65.52 | 67.21 | 66.37 |
| 06/10/2021 | 64.64 | 66.05 | 65.35 |
| 07/10/2021 | 64.61 | 65.59 | 65.1 |
| 08/10/2021 | 63.68 | 64.75 | 64.22 |
| 11/10/2021 | 64.49 | 66.04 | 65.27 |
| 12/10/2021 | 63.9 | 65.26 | 64.58 |
| 13/10/2021 | 63.61 | 64.89 | 64.25 |
| 14/10/2021 | 64.15 | 65.21 | 64.68 |
| 15/10/2021 | 64.25 | 65.49 | 64.87 |
| 18/10/2021 | 64.25 | 65.49 | 64.87 |
| 19/10/2021 | 64.46 | 65.79 | 65.13 |
| 20/10/2021 | 63.69 | 64.98 | 64.34 |
| 21/10/2021 | 63.75 | 65.19 | 64.47 |
| 22/10/2021 | 63.84 | 65.16 | 64.5 |
| 25/10/2021 | 64.29 | 65.56 | 64.93 |
| 26/10/2021 | 63.81 | 65.09 | 64.45 |
| 27/10/2021 | 64.25 | 65.53 | 64.89 |
| 28/10/2021 | 63.92 | 65.19 | 64.56 |
| 29/10/2021 | 64.17 | 65.41 | 64.79 |
| 01/11/2021 | 63.89 | 65.18 | 64.54 |
| 02/11/2021 | 63.98 | 65.29 | 64.64 |
| 03/11/2021 | 64.1 | 65.47 | 64.79 |
| 04/11/2021 | 63.65 | 65.13 | 64.39 |
| 05/11/2021 | 63.74 | 65.05 | 64.4 |
| 08/11/2021 | 64.04 | 65.26 | 64.65 |
| 09/11/2021 | 63.65 | 64.89 | 64.27 |
| 11/11/2021 | 63.55 | 64.86 | 64.21 |
| 12/11/2021 | 63.63 | 64.69 | 64.16 |
| 15/11/2021 | 63.52 | 64.94 | 64.23 |
| 16/11/2021 | 63.66 | 64.86 | 64.26 |
| 17/11/2021 | 63.61 | 64.92 | 64.27 |
| 18/11/2021 | 63.67 | 64.78 | 64.23 |
| 19/11/2021 | 63.63 | 64.77 | 64.2 |
| 22/11/2021 | 63.55 | 65.13 | 64.34 |
| 23/11/2021 | 63.56 | 64.88 | 64.22 |
| 24/11/2021 | 63.04 | 64.25 | 63.65 |
| 25/11/2021 | 62.97 | 64.34 | 63.66 |
| 26/11/2021 | 63.53 | 64.74 | 64.14 |
| 29/11/2021 | 63.19 | 64.45 | 63.82 |
| 30/11/2021 | 63.51 | 64.73 | 64.12 |
| 01/12/2021 | 62.84 | 64.03 | 63.44 |
| 02/12/2021 | 62.74 | 64.02 | 63.38 |
| 03/12/2021 | 63.24 | 64.51 | 63.88 |
| 06/12/2021 | 63.33 | 64.62 | 63.98 |
| 07/12/2021 | 63.45 | 64.52 | 63.99 |
| 08/12/2021 | 63.46 | 64.78 | 64.12 |
| 09/12/2021 | 63.7 | 65.02 | 64.36 |
| 10/12/2021 | 63.41 | 64.68 | 64.05 |
| 13/12/2021 | 63.46 | 64.61 | 64.04 |
| 14/12/2021 | 63.42 | 64.62 | 64.02 |
| 15/12/2021 | 63.78 | 65.1 | 64.44 |
| 16/12/2021 | 63.4 | 64.31 | 63.86 |
| 17/12/2021 | 63.53 | 64.86 | 64.2 |
| 20/12/2021 | 63.31 | 64.42 | 63.87 |
| 21/12/2021 | 63.09 | 64.58 | 63.84 |
| 22/12/2021 | 63.12 | 64.35 | 63.74 |
| 23/12/2021 | 63.32 | 64.55 | 63.94 |
| 27/12/2021 | 63.32 | 64.54 | 63.93 |
| 28/12/2021 | 63.43 | 64.61 | 64.02 |
| 29/12/2021 | 63.25 | 64.58 | 63.92 |
| 30/12/2021 | 63.25 | 64.43 | 63.84 |
| 31/12/2021 | 63.27 | 64.52 | 63.9 |
| 03/01/2022 | 63.3 | 64.58 | 63.94 |
| 04/01/2022 | 63.25 | 64.52 | 63.89 |
| 05/01/2022 | 63.32 | 64.55 | 63.94 |
| 06/01/2022 | 63.35 | 64.67 | 64.01 |
| 07/01/2022 | 63.67 | 64.97 | 64.32 |
| 10/01/2022 | 63.91 | 65.22 | 64.57 |
| 11/01/2022 | 63.63 | 64.96 | 64.3 |
| 12/01/2022 | 63.74 | 64.9 | 64.32 |
| 13/01/2022 | 64.14 | 65.26 | 64.7 |
| 14/01/2022 | 63.92 | 65.18 | 64.55 |
| 17/01/2022 | 63.87 | 65.07 | 64.47 |
| 18/01/2022 | 64.57 | 65.67 | 65.12 |
| 19/01/2022 | 64.03 | 65.4 | 64.72 |
| 20/01/2022 | 64.01 | 65.3 | 64.66 |
| 21/01/2022 | 64 | 65.15 | 64.58 |
| 24/01/2022 | 64.08 | 65.33 | 64.71 |
| 25/01/2022 | 64.06 | 65.34 | 64.7 |
| 26/01/2022 | 63.93 | 65.04 | 64.49 |
| 27/01/2022 | 63.77 | 65.1 | 64.44 |
| 28/01/2022 | 64.01 | 65.56 | 64.79 |
| 31/01/2022 | 64.43 | 65.71 | 65.07 |
| 01/02/2022 | 64.21 | 65.5 | 64.86 |
| 02/02/2022 | 64.25 | 65.48 | 64.87 |
| 04/02/2022 | 64.27 | 65.48 | 64.88 |
| 07/02/2022 | 64.08 | 65.34 | 64.71 |
| 08/02/2022 | 64.13 | 65.4 | 64.77 |
| 09/02/2022 | 64.22 | 65.33 | 64.78 |
| 10/02/2022 | 63.75 | 65.29 | 64.52 |
| 11/02/2022 | 64.4 | 65.49 | 64.95 |
| 14/02/2022 | 64.35 | 65.53 | 64.94 |
| 15/02/2022 | 64.08 | 65.47 | 64.78 |
| 16/02/2022 | 64.29 | 65.67 | 64.98 |
| 17/02/2022 | 64.2 | 65.35 | 64.78 |
| 18/02/2022 | 64.44 | 65.77 | 65.11 |
| 21/02/2022 | 64.25 | 65.27 | 64.76 |
| 22/02/2022 | 64.33 | 65.8 | 65.07 |
| 23/02/2022 | 63.91 | 65.37 | 64.64 |
| 24/02/2022 | 64.24 | 65.35 | 64.8 |
| 25/02/2022 | 64.46 | 65.69 | 65.08 |
| 28/02/2022 | 65.06 | 66.34 | 65.7 |
| 01/03/2022 | 64.92 | 66.27 | 65.6 |
| 02/03/2022 | 64.66 | 65.83 | 65.25 |
| 03/03/2022 | 64.52 | 65.8 | 65.16 |
| 04/03/2022 | 64.46 | 65.58 | 65.02 |
| 07/03/2022 | 64.99 | 66.18 | 65.59 |
| 08/03/2022 | 65.25 | 66.57 | 65.91 |
| 09/03/2022 | 65.18 | 66.49 | 65.84 |
| 10/03/2022 | 65.31 | 66.45 | 65.88 |
| 11/03/2022 | 64.8 | 66.01 | 65.41 |
| 14/03/2022 | 65.21 | 66.49 | 65.85 |
| 15/03/2022 | 64.36 | 65.81 | 65.09 |
| 16/03/2022 | 64.28 | 65.32 | 64.8 |
| 17/03/2022 | 65.13 | 66.44 | 65.79 |
| 18/03/2022 | 64.28 | 66.04 | 65.16 |
| 21/03/2022 | 64.45 | 65.85 | 65.15 |
| 22/03/2022 | 65.12 | 66.4 | 65.76 |
| 23/03/2022 | 65.15 | 66.43 | 65.79 |
| 24/03/2022 | 65.18 | 66.51 | 65.85 |
| 25/03/2022 | 64.95 | 66.26 | 65.61 |
| 28/03/2022 | 64.67 | 66.08 | 65.38 |
| 29/03/2022 | 64.67 | 65.62 | 65.15 |
| 30/03/2022 | 64.69 | 65.99 | 65.34 |
| 31/03/2022 | 64.87 | 65.96 | 65.42 |
| 01/04/2022 | 64.54 | 65.81 | 65.18 |
| 04/04/2022 | 64.3 | 65.67 | 64.99 |
| 05/04/2022 | 64.23 | 65.69 | 64.96 |
| 06/04/2022 | 64.65 | 65.7 | 65.18 |
| 08/04/2022 | 64.4 | 65.68 | 65.04 |
| 11/04/2022 | 64.67 | 66 | 65.34 |
| 12/04/2022 | 64.22 | 65.49 | 64.86 |
| 13/04/2022 | 64.79 | 66.03 | 65.41 |
| 14/04/2022 | 64.43 | 65.56 | 65 |
| 18/04/2022 | 64.29 | 65.82 | 65.06 |
| 19/04/2022 | 65.6 | 66.88 | 66.24 |
| 20/04/2022 | 64.71 | 65.85 | 65.28 |
| 21/04/2022 | 63.94 | 65.44 | 64.69 |
| 22/04/2022 | 64.07 | 65.29 | 64.68 |
| 25/04/2020 | 64.03 | 65.35 | 64.69 |
| 26/04/2022 | 64.12 | 65.24 | 64.68 |
| 27/04/2022 | 64.25 | 65.43 | 64.84 |
| 28/04/2022 | 64.04 | 65.55 | 64.8 |
| 29/04/2022 | 64.27 | 65.55 | 64.91 |
| 03/05/2022 | 63.9 | 65.29 | 64.6 |
| 04/05/2022 | 64.22 | 65.32 | 64.77 |
| 05/05/2022 | 63.85 | 65.31 | 64.58 |
| 06/05/2022 | 63.65 | 64.91 | 64.28 |
| 09/05/2022 | 63.89 | 64.97 | 64.43 |
| 10/05/2022 | 63.84 | 65.31 | 64.58 |
| 11/05/2022 | 63.67 | 64.85 | 64.26 |
| 12/05/2022 | 63.52 | 64.82 | 64.17 |
| 13/05/2022 | 63.68 | 64.95 | 64.32 |
| 16/05/2022 | 63.48 | 64.71 | 64.1 |
| 17/05/2022 | 63.55 | 64.7 | 64.13 |
| 18/05/2022 | 63.27 | 64.63 | 63.95 |
| 19/05/2022 | 63.58 | 64.39 | 63.99 |
| 20/05/2022 | 63.52 | 64.81 | 64.17 |
| 23/05/2022 | 63.35 | 64.73 | 64.04 |
| 24/05/2022 | 63.57 | 64.84 | 64.21 |
| 25/05/2022 | 63.58 | 64.27 | 63.93 |
| 26/05/2022 | 63.48 | 64.7 | 64.09 |
| 27/05/2022 | 63.51 | 64.71 | 64.11 |
| 30/05/2022 | 63.51 | 64.87 | 64.19 |
| 31/05/2022 | 63.46 | 64.7 | 64.08 |
| 01/06/2022 | 63.56 | 64.66 | 64.11 |
| 02/06/2022 | 63.3 | 64.56 | 63.93 |
| 03/06/2022 | 63.66 | 64.91 | 64.29 |
| 06/06/2022 | 63.68 | 65.02 | 64.35 |
| 07/06/2022 | 63.4 | 64.64 | 64.02 |
| 08/06/2022 | 63.61 | 64.84 | 64.23 |
| 09/06/2022 | 63.69 | 64.81 | 64.25 |
| 10/06/2022 | 63.52 | 64.8 | 64.16 |
| 13/06/2022 | 63.57 | 64.94 | 64.26 |
| 14/06/2022 | 63.81 | 64.92 | 64.37 |
| 15/06/2022 | 63.65 | 64.88 | 64.27 |
| 16/06/2022 | 63.77 | 64.93 | 64.35 |
| 17/06/2022 | 63.73 | 65.11 | 64.42 |
| 20/06/2022 | 64.06 | 65.15 | 64.61 |
| 21/06/2022 | 63.49 | 64.41 | 63.95 |
| 22/06/2022 | 63.06 | 64.75 | 63.91 |
| 23/06/2022 | 63.56 | 64.84 | 64.2 |
| 24/06/2022 | 63.81 | 64.9 | 64.36 |
| 27/06/2022 | 63.49 | 64.93 | 64.21 |
| 28/06/2022 | 63.48 | 64.78 | 64.13 |
| 29/06/2022 | 63.41 | 64.72 | 64.07 |
| 30/06/2022 | 63.59 | 64.83 | 64.21 |
| 01/07/2022 | 63.46 | 64.67 | 64.07 |
| 04/07/2022 | 63.8 | 65.06 | 64.43 |
| 05/07/2022 | 63.47 | 64.7 | 64.09 |
| 06/07/2022 | 63.75 | 64.93 | 64.34 |
| 07/07/2022 | 63.71 | 65 | 64.36 |
| 08/07/2022 | 63.52 | 64.77 | 64.15 |
| 11/07/2022 | 63.41 | 64.64 | 64.03 |
| 12/07/2022 | 63.56 | 64.87 | 64.22 |
| 13/07/2022 | 63.39 | 64.64 | 64.02 |
| 14/07/2022 | 63.12 | 64.6 | 63.86 |
| 15/07/2022 | 63.52 | 64.69 | 64.11 |
| 18/07/2022 | 63.41 | 64.67 | 64.04 |
| 19/07/2022 | 63.4 | 64.62 | 64.01 |
| 20/07/2022 | 63.38 | 64.63 | 64.01 |
| 21/07/2022 | 63.4 | 64.69 | 64.05 |
| 22/07/2022 | 63.5 | 64.74 | 64.12 |
| 25/07/2022 | 63.51 | 64.76 | 64.14 |
| 26/07/2022 | 63.39 | 64.58 | 63.99 |
| 27/07/2022 | 63.6 | 64.88 | 64.24 |
| 28/07/2022 | 63.36 | 64.76 | 64.06 |
| 29/07/2022 | 63.46 | 64.64 | 64.05 |
| 01/08/2022 | 63.49 | 64.74 | 64.12 |
| 02/08/2022 | 63.26 | 64.43 | 63.85 |
| 03/08/2022 | 63.04 | 64.31 | 63.68 |
| 04/08/2022 | 63.13 | 64.54 | 63.84 |
| 05/08/2022 | 63.22 | 64.4 | 63.81 |
| 08/08/2022 | 63.28 | 64.68 | 63.98 |
| 09/08/2022 | 63.32 | 64.53 | 63.93 |
| 10/08/2022 | 63.17 | 64.41 | 63.79 |
| 11/08/2022 | 63.19 | 64.49 | 63.84 |
| 12/08/2022 | 63.14 | 64.41 | 63.78 |
| 15/08/2022 | 63.08 | 64.33 | 63.71 |
| 16/08/2022 | 63.03 | 64.38 | 63.71 |
| 17/08/2022 | 63.11 | 64.34 | 63.73 |
| 18/08/2022 | 63.19 | 64.44 | 63.82 |
| 19/08/2022 | 63.11 | 64.36 | 63.74 |
| 22/08/2022 | 63.14 | 64.36 | 63.75 |
| 23/08/2022 | 63.04 | 64.34 | 63.69 |
| 24/08/2022 | 63.15 | 64.39 | 63.77 |
| 25/08/2022 | 63.04 | 64.27 | 63.66 |
| 26/08/2022 | 63.13 | 64.34 | 63.74 |
| 29/08/2022 | 63.31 | 64.52 | 63.92 |
| 30/08/2022 | 63.27 | 64.58 | 63.93 |
| 31/08/2022 | 63.24 | 64.52 | 63.88 |
| 01/09/2022 | 63.29 | 64.29 | 63.79 |
| 02/09/2022 | 63.38 | 64.54 | 63.96 |
| 05/09/2022 | 63.24 | 64.44 | 63.84 |
| 06/09/2022 | 63.26 | 64.56 | 63.91 |
| 08/09/2022 | 63.19 | 64.42 | 63.81 |
| 09/09/2022 | 63.27 | 64.56 | 63.92 |
| 12/09/2022 | 63.2 | 64.39 | 63.8 |
| 13/09/2022 | 63.26 | 64.44 | 63.85 |
| 14/09/2022 | 63.41 | 64.66 | 64.04 |
| 15/09/2022 | 63.33 | 64.65 | 63.99 |
| 16/09/2022 | 63.43 | 64.66 | 64.05 |
| 19/09/2022 | 63.57 | 64.86 | 64.22 |
| 20/09/2022 | 63.32 | 64.56 | 63.94 |
| 21/09/2022 | 63.25 | 64.43 | 63.84 |
| 22/09/2022 | 63.37 | 64.66 | 64.02 |
| 23/09/2022 | 63.52 | 64.74 | 64.13 |
| 27/09/2022 | 63.64 | 64.92 | 64.28 |
| 28/09/2022 | 63.54 | 64.84 | 64.19 |
| 29/09/2022 | 63.18 | 64.38 | 63.78 |
| 30/09/2022 | 63.26 | 64.49 | 63.88 |
| 03/10/2022 | 63.44 | 64.75 | 64.1 |
| 05/10/2022 | 63.37 | 64.61 | 63.99 |
| 06/10/2022 | 63.25 | 64.4 | 63.83 |
| 07/10/2022 | 63.51 | 64.75 | 64.13 |
| 10/10/2022 | 63.41 | 64.66 | 64.04 |
| 11/10/2022 | 63.32 | 64.6 | 63.96 |
| 12/10/2022 | 63.22 | 64.48 | 63.85 |
| 13/10/2022 | 63.35 | 64.5 | 63.93 |
| 14/10/2022 | 63.2 | 64.51 | 63.86 |
| 17/10/2022 | 63.17 | 64.4 | 63.79 |
| 18/10/2022 | 63 | 64.27 | 63.64 |
| 19/10/2022 | 62.97 | 64.21 | 63.59 |
| 20/10/2022 | 62.92 | 64.18 | 63.55 |
| 21/10/2022 | 63.05 | 64.3 | 63.68 |
| 24/10/2022 | 63 | 64.25 | 63.63 |
| 25/10/2022 | 63.12 | 64.38 | 63.75 |
| 26/10/2022 | 63.1 | 64.39 | 63.75 |
| 27/10/2022 | 63.17 | 64.38 | 63.78 |
| 28/10/2022 | 63.07 | 64.33 | 63.7 |
| 31/10/2022 | 63.18 | 64.39 | 63.79 |
| 01/11/2022 | 63.14 | 64.41 | 63.78 |
| 02/11/2022 | 63.21 | 64.45 | 63.83 |
| 03/11/2022 | 62.98 | 64.25 | 63.62 |
| 04/11/2022 | 63.08 | 64.33 | 63.71 |
| 07/11/2022 | 63.03 | 64.28 | 63.66 |
| 08/11/2022 | 63.06 | 64.27 | 63.67 |
| 09/11/2022 | 62.99 | 64.32 | 63.66 |
| 11/11/2022 | 63.08 | 64.34 | 63.71 |
| 14/11/2022 | 63.06 | 64.36 | 63.71 |
| 15/11/2022 | 62.97 | 64.28 | 63.63 |
| 16/11/2022 | 63.17 | 64.37 | 63.77 |
| 17/11/2022 | 63.19 | 64.41 | 63.8 |
| 18/11/2022 | 63.12 | 64.42 | 63.77 |
| 21/11/2022 | 63.08 | 64.32 | 63.7 |
| 22/11/2022 | 63.05 | 64.29 | 63.67 |
| 23/11/2022 | 63.06 | 64.3 | 63.68 |
| 24/11/2022 | 63.14 | 64.41 | 63.78 |
| 25/11/2022 | 63.1 | 64.36 | 63.73 |
| 28/11/2022 | 63.06 | 64.31 | 63.69 |
| 29/11/2022 | 62.57 | 63.75 | 63.16 |
| 30/11/2022 | 62.83 | 64.1 | 63.47 |
| 01/12/2022 | 63 | 64.23 | 63.62 |
| 02/12/2022 | 63.05 | 64.32 | 63.69 |
| 05/12/2022 | 63.07 | 64.32 | 63.7 |
| 06/12/2022 | 63.24 | 64.52 | 63.88 |
| 07/12/2022 | 63.11 | 64.39 | 63.75 |
| 08/12/2022 | 63.15 | 64.4 | 63.78 |
| 09/12/2022 | 63.12 | 64.35 | 63.74 |
| 12/12/2022 | 63.26 | 64.51 | 63.89 |
| 13/12/2022 | 63.14 | 64.36 | 63.75 |
| 14/12/2022 | 63.17 | 64.44 | 63.81 |
| 15/12/2022 | 63.18 | 64.48 | 63.83 |
| 16/12/2022 | 63.25 | 64.5 | 63.88 |
| 19/12/2022 | 63.31 | 64.41 | 63.86 |
| 20/12/2022 | 63.14 | 64.39 | 63.77 |
| 21/12/2022 | 63.55 | 64.77 | 64.16 |
| 22/12/2022 | 63.56 | 64.84 | 64.2 |
| 23/12/2022 | 63.54 | 64.81 | 64.18 |
| 27/12/2022 | 63.39 | 64.63 | 64.01 |
| 28/12/2022 | 63.46 | 64.7 | 64.08 |
| 29/12/2022 | 63.39 | 64.66 | 64.03 |
| 30/12/2022 | 63.5 | 64.79 | 64.15 |
| 03/01/2023 | 63.44 | 64.71 | 64.08 |
| 04/01/2023 | 63.52 | 64.8 | 64.16 |
| 05/01/2023 | 63.68 | 65 | 64.34 |
| 06/01/2023 | 63.77 | 64.95 | 64.36 |
| 09/01/2023 | 63.5 | 64.73 | 64.12 |
| 10/01/2023 | 64.3 | 65.59 | 64.95 |
| 11/01/2023 | 63.92 | 65.32 | 64.62 |
| 12/01/2023 | 63.59 | 65.86 | 65.23 |
| 13/01/2023 | 63.53 | 65.82 | 65.18 |
| 16/01/2023 | 63.57 | 65.83 | 65.2 |
| 17/01/2023 | 64.6 | 65.8 | 65.2 |
| 18/01/2023 | 64.54 | 65.8 | 65.17 |
| 19/01/2023 | 64.92 | 66.13 | 65.53 |
| 20/01/2023 | 64.67 | 65.96 | 65.32 |
| 23/01/2023 | 64.79 | 66.08 | 65.44 |
| 24/01/2023 | 64.74 | 66.06 | 65.4 |
| 25/01/2023 | 64.84 | 66.11 | 65.48 |
| 26/01/2023 | 64.6 | 65.91 | 65.26 |
| 27/01/2023 | 64.76 | 66.06 | 65.41 |
| 30/01/2023 | 64.72 | 65.8 | 65.26 |
| 31/01/2023 | 64.75 | 66.08 | 65.42 |
| 01/02/2023 | 64.81 | 66.23 | 65.52 |
| 02/02/2023 | 64.75 | 66.05 | 65.4 |
| 06/02/2023 | 64.69 | 66 | 65.35 |
| 07/02/2023 | 64.8 | 66.02 | 65.41 |
| 08/02/2023 | 64.57 | 65.81 | 65.19 |
| 09/02/2023 | 65.05 | 66.34 | 65.7 |
| 10/02/2023 | 64.9 | 66.16 | 65.53 |
| 13/02/2023 | 65.1 | 66.47 | 65.79 |
| 14/02/2023 | 64.81 | 66.18 | 65.5 |
| 15/02/2023 | 64.13 | 65.41 | 64.77 |
| 16/02/2023 | 64.79 | 65.83 | 65.31 |
| 17/02/2023 | 65.18 | 66.45 | 65.82 |
| 20/02/2023 | 64.77 | 66.11 | 65.44 |
| 21/02/2023 | 64.74 | 66.14 | 65.44 |
| 22/02/2023 | 64.73 | 65.88 | 65.31 |
| 23/02/2023 | 65.42 | 66.61 | 66.02 |
| 24/02/2023 | 64.81 | 66.1 | 65.46 |
| 27/02/2023 | 64.89 | 66 | 65.45 |
| 28/02/2023 | 64.46 | 65.77 | 65.12 |
| 01/03/2023 | 65.05 | 66.44 | 65.75 |
| 02/03/2023 | 65.03 | 66.3 | 65.67 |
| 03/03/2023 | 64.95 | 66.24 | 65.6 |
| 06/03/2023 | 65.35 | 66.61 | 65.98 |
| 07/03/2023 | 65.09 | 66.4 | 65.75 |
| 08/03/2023 | 65.02 | 66.14 | 65.58 |
| 09/03/2023 | 65.09 | 66.4 | 65.75 |
| 10/03/2023 | 65.52 | 66.82 | 66.17 |
| 13/03/2023 | 65.26 | 66.46 | 65.86 |
| 14/03/2023 | 65.98 | 67.31 | 66.65 |
| 15/03/2023 | 66.1 | 67.43 | 66.77 |
| 16/03/2023 | 65.41 | 66.81 | 66.11 |
| 17/03/2023 | 65.66 | 66.94 | 66.3 |
| 20/03/2023 | 65.89 | 67.18 | 66.54 |
| 21/03/2023 | 65.23 | 66.62 | 65.93 |
| 22/03/2023 | 65.22 | 66.53 | 65.88 |
| 23/03/2023 | 65.76 | 67.08 | 66.42 |
| 24/03/2023 | 65.57 | 66.85 | 66.21 |
| 27/03/2023 | 66.05 | 67.35 | 66.7 |
| 28/03/2023 | 65.95 | 67.33 | 66.64 |
| 29/03/2023 | 66.11 | 67.45 | 66.78 |
| 30/03/2023 | 65.49 | 67.37 | 66.43 |
| 31/03/2023 | 65.54 | 67.17 | 66.36 |
| 03/04/2023 | 65.67 | 65.94 | 65.81 |
| 04/04/2023 | 65.63 | 66.92 | 66.28 |
| 05/04/2023 | 65.96 | 67.33 | 66.65 |
| 06/04/2023 | 65.22 | 66.5 | 65.86 |
| 10/04/2023 | 65.47 | 66.83 | 66.15 |
| 11/04/2023 | 65.08 | 66.51 | 65.8 |
| 12/04/2023 | 64.23 | 65.45 | 64.84 |
| 13/04/2023 | 64.1 | 65.25 | 64.68 |
| 14/04/2023 | 64.4 | 65.69 | 65.05 |
| 17/04/2023 | 64.37 | 65.74 | 65.06 |
| 18/04/2023 | 64.26 | 65.5 | 64.88 |
| 19/04/2023 | 64.16 | 65.32 | 64.74 |
| 20/04/2023 | 64.31 | 65.51 | 64.91 |
| 21/04/2023 | 64.4 | 65.69 | 65.05 |
| 24/04/2023 | 64 | 65.47 | 64.74 |
| 25/04/2023 | 64.14 | 65.35 | 64.75 |
| 26/04/2023 | 64.23 | 65.45 | 64.84 |
| 27/04/2023 | 63.88 | 65.27 | 64.58 |
| 28/04/2023 | 64.06 | 65.32 | 64.69 |
| 02/05/2023 | 64.36 | 65.53 | 64.95 |
| 03/05/2023 | 64.34 | 65.68 | 65.01 |
| 04/05/2023 | 63.98 | 65.33 | 64.66 |
| 05/05/2023 | 64.29 | 65.47 | 64.88 |
| 08/05/2023 | 64.6 | 65.9 | 65.25 |
| 09/05/2023 | 64.36 | 65.64 | 65 |
| 10/05/2023 | 64.33 | 65.61 | 64.97 |
| 11/05/2023 | 64.33 | 65.49 | 64.91 |
| 12/05/2023 | 64.45 | 65.74 | 65.1 |
| 15/05/2023 | 64.83 | 66.13 | 65.48 |
| 16/05/2023 | 64.45 | 65.66 | 65.06 |
| 17/05/2023 | 64.28 | 65.58 | 64.93 |
| 18/05/2023 | 64.48 | 65.72 | 65.1 |
| 19/05/2023 | 64.47 | 65.73 | 65.1 |
| 22/05/2023 | 64.67 | 65.88 | 65.28 |
| 23/05/2023 | 64.39 | 65.71 | 65.05 |
| 24/05/2023 | 64.43 | 65.72 | 65.08 |
| 25/05/2023 | 64.47 | 65.68 | 65.08 |
| 26/05/2023 | 64.69 | 66.03 | 65.36 |
| 29/05/2023 | 64.58 | 65.81 | 65.2 |
| 30/05/2023 | 64.32 | 65.52 | 64.92 |
| 31/05/2023 | 64.58 | 65.8 | 65.19 |
| 01/06/2023 | 64.65 | 65.94 | 65.3 |
| 02/06/2023 | 64.42 | 65.74 | 65.08 |
| 05/06/2023 | 64.77 | 66.08 | 65.43 |
| 06/06/2023 | 64.58 | 65.84 | 65.21 |
| 07/06/2023 | 64.66 | 66.19 | 65.43 |
| 08/06/2023 | 64.59 | 65.59 | 65.09 |
| 09/06/2023 | 64.94 | 66.26 | 65.6 |
| 12/06/2023 | 64.83 | 66.12 | 65.48 |
| 13/06/2023 | 64.87 | 66.07 | 65.47 |
| 14/06/2023 | 64.76 | 65.94 | 65.35 |
| 15/06/2023 | 64.77 | 66.12 | 65.45 |
| 16/06/2023 | 65.17 | 66.42 | 65.8 |
| 19/06/2023 | 65.42 | 66.74 | 66.08 |
| 20/06/2023 | 65.29 | 66.47 | 65.88 |
| 21/06/2023 | 65.21 | 66.28 | 65.75 |
| 22/06/2023 | 65.19 | 66.46 | 65.83 |
| 23/06/2023 | 65.3 | 66.65 | 65.98 |
| 27/06/2023 | 65.28 | 66.62 | 65.95 |
| 28/06/2023 | 64.76 | 65.98 | 65.37 |
| 29/06/2023 | 65.28 | 66.57 | 65.93 |
| 30/06/2023 | 65.06 | 66.2 | 65.63 |
| 03/07/2023 | 65.02 | 66.3 | 65.66 |
| 04/07/2023 | 65.15 | 66.36 | 65.76 |
| 05/07/2023 | 64.56 | 66.03 | 65.3 |
| 06/07/2023 | 65.32 | 66.42 | 65.87 |
| 07/07/2023 | 65.22 | 66.56 | 65.89 |
| 10/07/2023 | 64.98 | 66.18 | 65.58 |
| 11/07/2023 | 64.55 | 65.97 | 65.26 |
| 12/07/2023 | 65.06 | 66.21 | 65.64 |
| 13/07/2023 | 64.85 | 66.21 | 65.53 |
| 14/07/2023 | 65 | 66.22 | 65.61 |
| 17/07/2023 | 65.36 | 66.63 | 66 |
| 18/07/2023 | 65.44 | 66.79 | 66.12 |
| 19/07/2023 | 64.89 | 66.14 | 65.52 |
| 20/07/2023 | 64.98 | 66.72 | 65.85 |
| 21/07/2023 | 65.53 | 66.84 | 66.19 |
| 24/07/2023 | 65.42 | 66.79 | 66.11 |
| 25/07/2023 | 65.12 | 66.39 | 65.76 |
| 26/07/2023 | 64.96 | 66.37 | 65.67 |
| 27/07/2023 | 65.27 | 66.38 | 65.83 |
| 28/07/2023 | 65.49 | 66.76 | 66.13 |
| 31/07/2023 | 65.13 | 66.41 | 65.77 |
| 01/08/2023 | 65.15 | 66.55 | 65.85 |
| 02/08/2023 | 65.43 | 66.73 | 66.08 |
| 03/08/2023 | 65.56 | 66.87 | 66.22 |
| 04/08/2023 | 65.82 | 67 | 66.41 |
| 07/08/2023 | 64.93 | 66.61 | 65.77 |
| 08/08/2023 | 65.72 | 66.97 | 66.35 |
| 09/08/2023 | 64.96 | 66.37 | 65.67 |
| 10/08/2023 | 65.11 | 66.39 | 65.75 |
| 11/08/2023 | 65.54 | 66.82 | 66.18 |
| 14/08/2023 | 65.14 | 66.6 | 65.87 |
| 15/08/2023 | 65.29 | 66.53 | 65.91 |
| 16/08/2023 | 65.19 | 66.35 | 65.77 |
| 17/08/2023 | 64.63 | 65.93 | 65.28 |
| 18/08/2023 | 65.14 | 66.37 | 65.76 |
| 21/08/2023 | 64.85 | 66.41 | 65.63 |
| 22/08/2023 | 65.49 | 66.79 | 66.14 |
| 23/08/2023 | 65.03 | 65.93 | 65.48 |
| 24/08/2023 | 64.86 | 66.12 | 65.49 |
| 25/08/2023 | 65.55 | 66.84 | 66.2 |
| 28/08/2023 | 65.27 | 66.35 | 65.81 |
| 29/08/2023 | 65.22 | 66.68 | 65.95 |
| 30/08/2023 | 65.09 | 66.35 | 65.72 |
| 31/08/2023 | 65.47 | 66.81 | 66.14 |
| 01/09/2023 | 65.14 | 66.41 | 65.78 |
| 04/09/2023 | 65.15 | 66.27 | 65.71 |
| 05/09/2023 | 65.52 | 66.89 | 66.21 |
| 06/09/2023 | 65.33 | 66.53 | 65.93 |
| 08/09/2023 | 65.15 | 66.45 | 65.8 |
| 11/09/2023 | 65.15 | 66.44 | 65.8 |
| 12/09/2023 | 65.46 | 66.73 | 66.1 |
| 13/09/2023 | 65.23 | 66.53 | 65.88 |
| 14/09/2023 | 65.1 | 66.33 | 65.72 |
| 15/09/2023 | 65.09 | 66.38 | 65.74 |
| 18/09/2023 | 65.24 | 66.51 | 65.88 |
| 19/09/2023 | 65.17 | 66.46 | 65.82 |
| 20/09/2023 | 65.61 | 66.98 | 66.3 |
| 21/09/2023 | 65.22 | 66.49 | 65.86 |
| 22/09/2023 | 65.45 | 66.72 | 66.09 |
| 26/09/2023 | 65.18 | 66.48 | 65.83 |
| 27/09/2023 | 65.25 | 66.69 | 65.97 |
| 28/09/2023 | 65.14 | 66.39 | 65.77 |
| 29/09/2023 | 65.54 | 66.84 | 66.19 |
| 02/10/2023 | 65.25 | 66.58 | 65.92 |
| 03/10/2023 | 65.54 | 66.88 | 66.21 |
| 05/10/2023 | 65.47 | 66.61 | 66.04 |
| 06/10/2023 | 65.36 | 66.62 | 65.99 |
| 09/10/2023 | 65.44 | 66.88 | 66.16 |
| 10/10/2023 | 65.35 | 66.74 | 66.05 |
| 12/10/2023 | 65.73 | 66.95 | 66.34 |
| 13/10/2023 | 65.41 | 66.64 | 66.03 |
| 16/10/2023 | 65.7 | 67.1 | 66.4 |
| 17/10/2023 | 65.31 | 66.99 | 66.15 |
| 18/10/2023 | 65.33 | 66.23 | 65.78 |
| 19/10/2023 | 65.21 | 66.74 | 65.98 |
| 20/10/2023 | 65.28 | 66.48 | 65.88 |
| 23/10/2023 | 65.11 | 66.46 | 65.79 |
| 24/10/2023 | 64.76 | 65.93 | 65.35 |
| 25/10/2023 | 64.51 | 65.94 | 65.23 |
| 26/10/2023 | 64.43 | 65.35 | 64.89 |
| 27/10/2023 | 64.89 | 66.29 | 65.59 |
| 30/10/2023 | 64.61 | 65.71 | 65.16 |
| 31/10/2023 | 64.75 | 66.14 | 65.45 |
| 01/11/2023 | 65.29 | 66.4 | 65.85 |
| 02/11/2023 | 65.25 | 66.49 | 65.87 |
| 03/11/2023 | 65.56 | 66.84 | 66.2 |
| 06/11/2023 | 64.83 | 66.47 | 65.65 |
| 07/11/2023 | 65.54 | 66.61 | 66.08 |
| 08/11/2023 | 65.33 | 66.7 | 66.02 |
| 09/11/2023 | 65.54 | 66.82 | 66.18 |
| 13/11/2023 | 65.79 | 66.95 | 66.37 |
| 14/11/2023 | 65.07 | 66.5 | 65.79 |
| 15/11/2023 | 65.44 | 66.59 | 66.02 |
| 16/11/2023 | 65.77 | 67.19 | 66.48 |
| 17/11/2023 | 65.24 | 66.42 | 65.83 |
| 20/11/2023 | 65.2 | 66.91 | 66.06 |
| 21/11/2023 | 65.34 | 66.57 | 65.96 |
| 22/11/2023 | 64.84 | 66.2 | 65.52 |
| 23/11/2023 | 64.94 | 66.1 | 65.52 |
| 24/11/2023 | 65.01 | 66.33 | 65.67 |
| 27/11/2023 | 64.81 | 66.36 | 65.59 |
| 28/11/2023 | 65.54 | 66.59 | 66.07 |
| 29/11/2023 | 65.09 | 66.58 | 65.84 |
| 30/11/2023 | 65.16 | 66.52 | 65.84 |
| 01/12/2023 | 65.56 | 66.83 | 66.2 |
| 04/12/2023 | 65.44 | 66.69 | 66.07 |
| 05/12/2023 | 65.59 | 66.83 | 66.21 |
| 06/12/2023 | 65.03 | 66.45 | 65.74 |
| 07/12/2023 | 65.44 | 66.68 | 66.06 |
| 08/12/2023 | 64.79 | 65.96 | 65.38 |
| 11/12/2023 | 65.55 | 66.77 | 66.16 |
| 12/12/2023 | 65.02 | 66.38 | 65.7 |
| 13/12/2023 | 65.07 | 66.41 | 65.74 |
| 14/12/2023 | 65.06 | 66.36 | 65.71 |
| 15/12/2023 | 65.22 | 66.52 | 65.87 |
| 18/12/2023 | 65.01 | 66.25 | 65.63 |
| 19/12/2023 | 64.76 | 66.17 | 65.47 |
| 20/12/2023 | 65.01 | 66.27 | 65.64 |
| 21/12/2023 | 64.94 | 66.19 | 65.57 |
| 22/12/2023 | 65.47 | 66.74 | 66.11 |
| 26/12/2023 | 65.23 | 66.53 | 65.88 |
| 27/12/2023 | 65.06 | 66.49 | 65.78 |
| 28/12/2023 | 64.56 | 65.85 | 65.21 |
| 29/12/2023 | 64.91 | 66.1 | 65.51 |
| 02/01/2024 | 65.18 | 66.56 | 65.87 |
| 03/01/2024 | 65.32 | 66.83 | 66.08 |
| 04/01/2024 | 65.11 | 66.18 | 65.65 |
| 05/01/2024 | 65.23 | 66.47 | 65.85 |
| 08/01/2024 | 64.9 | 66.25 | 65.58 |
| 09/01/2024 | 65.02 | 66.27 | 65.65 |
| 10/01/2024 | 64.9 | 66.18 | 65.54 |
| 11/01/2024 | 65.44 | 66.72 | 66.08 |
| 12/01/2024 | 65.24 | 66.53 | 65.89 |
| 15/01/2024 | 65.1 | 66.46 | 65.78 |
| 16/01/2024 | 65.99 | 67.34 | 66.67 |
| 17/01/2024 | 65.26 | 66.69 | 65.98 |
| 18/01/2024 | 65.15 | 66.36 | 65.76 |
| 19/01/2024 | 65.38 | 66.56 | 65.97 |
| 22/01/2024 | 65.24 | 66.67 | 65.96 |
| 23/01/2024 | 65.55 | 66.79 | 66.17 |
| 24/01/2024 | 65.12 | 66.57 | 65.85 |
| 25/01/2024 | 65.55 | 66.75 | 66.15 |
| 26/01/2024 | 65.61 | 66.92 | 66.27 |
| 29/01/2024 | 65.38 | 66.52 | 65.95 |
| 30/01/2024 | 65.86 | 67.31 | 66.59 |
| 31/01/2024 | 65.43 | 66.96 | 66.2 |
| 01/02/2024 | 65.55 | 66.57 | 66.06 |
| 02/02/2024 | 65.99 | 67.3 | 66.65 |
| 05/02/2024 | 65.56 | 66.75 | 66.16 |
| 06/02/2024 | 65.69 | 67 | 66.35 |
| 07/02/2024 | 65.53 | 66.75 | 66.14 |
| 08/02/2024 | 65.25 | 66.57 | 65.91 |
| 09/02/2024 | 66.16 | 67.43 | 66.8 |
| 12/02/2024 | 65.75 | 66.9 | 66.33 |
| 13/02/2024 | 65.48 | 66.92 | 66.2 |
| 14/02/2024 | 65.86 | 67.16 | 66.51 |
| 15/02/2024 | 65.57 | 66.73 | 66.15 |
| 16/02/2024 | 65.76 | 67.12 | 66.44 |
| 19/02/2024 | 66 | 67.35 | 66.68 |
| 20/02/2024 | 65.75 | 67.06 | 66.41 |
| 21/02/2024 | 65.91 | 67.27 | 66.59 |
| 22/02/2024 | 65.15 | 66.57 | 65.86 |
| 23/02/2024 | 65.84 | 67.03 | 66.44 |
| 26/02/2024 | 66.73 | 67.79 | 67.26 |
| 27/02/2024 | 65.72 | 67.44 | 66.58 |
| 28/02/2024 | 65.42 | 66.6 | 66.01 |
| 29/02/2024 | 66.37 | 67.67 | 67.02 |
| 01/03/2024 | 66.14 | 67.32 | 66.73 |
| 04/03/2024 | 65.7 | 67.22 | 66.46 |
| 05/03/2024 | 66.32 | 67.54 | 66.93 |
| 06/03/2024 | 65.83 | 67.14 | 66.49 |
| 07/03/2024 | 65.6 | 67.03 | 66.32 |
| 08/03/2024 | 65.89 | 67.16 | 66.53 |
| 11/03/2024 | 66.41 | 67.7 | 67.06 |
| 12/03/2024 | 65.46 | 67 | 66.23 |
| 13/03/2024 | 66.49 | 67.85 | 67.17 |
| 14/03/2024 | 65.7 | 67 | 66.35 |
| 15/03/2024 | 65.93 | 67.23 | 66.58 |
| 18/03/2024 | 65.66 | 66.92 | 66.29 |
| 19/03/2024 | 66.01 | 67.28 | 66.65 |
| 20/03/2024 | 65.28 | 66.72 | 66 |
| 21/03/2024 | 65.53 | 66.94 | 66.24 |
| 22/03/2024 | 66.01 | 67.1 | 66.56 |
| 25/03/2024 | 65.57 | 66.84 | 66.21 |
| 26/03/2024 | 65.53 | 66.95 | 66.24 |
| 27/03/2024 | 65.34 | 66.53 | 65.94 |
| 28/03/2024 | 65.59 | 66.93 | 66.26 |
| 01/04/2024 | 65.78 | 67.1 | 66.44 |
| 02/04/2024 | 66.1 | 67.42 | 66.76 |
| 03/04/2024 | 65.47 | 66.75 | 66.11 |
| 04/04/2024 | 65.69 | 67.11 | 66.4 |
| 05/04/2024 | 65.91 | 67.16 | 66.54 |
| 09/04/2024 | 65.75 | 67.05 | 66.4 |
| 10/04/2024 | 66.78 | 68.11 | 67.45 |
| 11/04/2024 | 66.23 | 67.45 | 66.84 |
| 12/04/2024 | 65.96 | 67.25 | 66.61 |
| 15/04/2024 | 65.93 | 67.19 | 66.56 |
| 16/04/2024 | 65.91 | 67.29 | 66.6 |
| 17/04/2024 | 65.76 | 67.28 | 66.52 |
| 18/04/2024 | 65.61 | 66.93 | 66.27 |
| 19/04/2024 | 66.38 | 67.7 | 67.04 |
| 22/04/2024 | 66.26 | 67.5 | 66.88 |
| 23/04/2024 | 66.04 | 67.44 | 66.74 |
| 24/04/2024 | 66.05 | 67.39 | 66.72 |
| 25/04/2024 | 66.56 | 67.86 | 67.21 |
| 26/04/2024 | 66.03 | 67.33 | 66.68 |
| 29/04/2024 | 66.26 | 67.6 | 66.93 |
| 30/04/2024 | 66.41 | 67.66 | 67.04 |